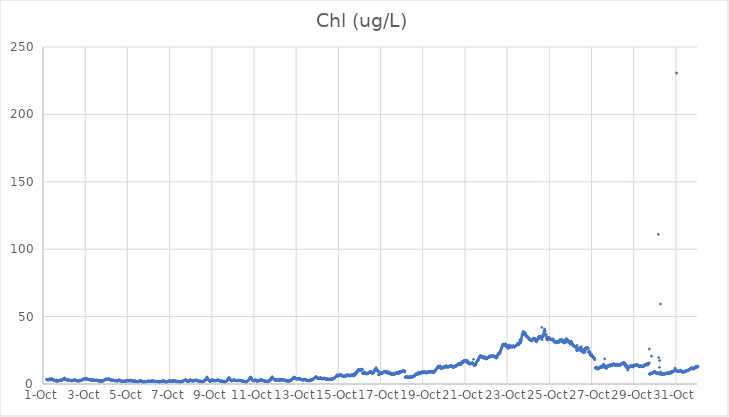
| Category | Chl (ug/L) |
|---|---|
| 44835.166666666664 | 3.35 |
| 44835.177083333336 | 3.45 |
| 44835.1875 | 3.31 |
| 44835.197916666664 | 3.45 |
| 44835.208333333336 | 3.27 |
| 44835.21875 | 3.15 |
| 44835.229166666664 | 3.12 |
| 44835.239583333336 | 2.91 |
| 44835.25 | 3.15 |
| 44835.260416666664 | 3.2 |
| 44835.270833333336 | 3.08 |
| 44835.28125 | 3.42 |
| 44835.291666666664 | 3.69 |
| 44835.302083333336 | 3.59 |
| 44835.3125 | 3.55 |
| 44835.322916666664 | 3.67 |
| 44835.333333333336 | 3.62 |
| 44835.34375 | 3.71 |
| 44835.354166666664 | 3.26 |
| 44835.364583333336 | 3.09 |
| 44835.375 | 3.1 |
| 44835.385416666664 | 3.78 |
| 44835.395833333336 | 3.61 |
| 44835.40625 | 3.42 |
| 44835.416666666664 | 3.48 |
| 44835.427083333336 | 3.47 |
| 44835.4375 | 3.51 |
| 44835.447916666664 | 3.62 |
| 44835.458333333336 | 3.54 |
| 44835.46875 | 3.47 |
| 44835.479166666664 | 3.13 |
| 44835.489583333336 | 2.75 |
| 44835.5 | 2.81 |
| 44835.510416666664 | 2.68 |
| 44835.520833333336 | 2.73 |
| 44835.53125 | 2.64 |
| 44835.541666666664 | 2.91 |
| 44835.552083333336 | 2.82 |
| 44835.5625 | 2.74 |
| 44835.572916666664 | 2.68 |
| 44835.583333333336 | 2.28 |
| 44835.59375 | 2.43 |
| 44835.604166666664 | 2.49 |
| 44835.614583333336 | 2.49 |
| 44835.625 | 2.88 |
| 44835.635416666664 | 2.78 |
| 44835.645833333336 | 1.88 |
| 44835.65625 | 2.36 |
| 44835.666666666664 | 2.53 |
| 44835.677083333336 | 2.5 |
| 44835.6875 | 2.61 |
| 44835.697916666664 | 2.34 |
| 44835.708333333336 | 2.54 |
| 44835.71875 | 2.65 |
| 44835.729166666664 | 2.31 |
| 44835.739583333336 | 2.56 |
| 44835.75 | 2.69 |
| 44835.760416666664 | 2.57 |
| 44835.770833333336 | 2.71 |
| 44835.78125 | 2.32 |
| 44835.791666666664 | 2.62 |
| 44835.802083333336 | 2.46 |
| 44835.8125 | 2.63 |
| 44835.822916666664 | 2.79 |
| 44835.833333333336 | 2.88 |
| 44835.84375 | 2.68 |
| 44835.854166666664 | 3.02 |
| 44835.864583333336 | 2.83 |
| 44835.875 | 2.84 |
| 44835.885416666664 | 2.99 |
| 44835.895833333336 | 2.89 |
| 44835.90625 | 3.06 |
| 44835.916666666664 | 2.99 |
| 44835.927083333336 | 3.11 |
| 44835.9375 | 3.11 |
| 44835.947916666664 | 3.25 |
| 44835.958333333336 | 3.62 |
| 44835.96875 | 3.66 |
| 44835.979166666664 | 3.68 |
| 44835.989583333336 | 3.55 |
| 44836.0 | 3.85 |
| 44836.010416666664 | 4.26 |
| 44836.020833333336 | 4.28 |
| 44836.03125 | 4.2 |
| 44836.041666666664 | 3.25 |
| 44836.052083333336 | 3.84 |
| 44836.0625 | 3.79 |
| 44836.072916666664 | 3.73 |
| 44836.083333333336 | 3.25 |
| 44836.09375 | 3.41 |
| 44836.104166666664 | 3.36 |
| 44836.114583333336 | 3.05 |
| 44836.125 | 3.14 |
| 44836.135416666664 | 2.97 |
| 44836.145833333336 | 3.1 |
| 44836.15625 | 2.86 |
| 44836.166666666664 | 2.95 |
| 44836.177083333336 | 2.73 |
| 44836.1875 | 2.84 |
| 44836.197916666664 | 3.12 |
| 44836.208333333336 | 2.78 |
| 44836.21875 | 2.68 |
| 44836.229166666664 | 3.06 |
| 44836.239583333336 | 2.82 |
| 44836.25 | 2.99 |
| 44836.260416666664 | 2.72 |
| 44836.270833333336 | 2.83 |
| 44836.28125 | 2.63 |
| 44836.291666666664 | 2.58 |
| 44836.302083333336 | 2.41 |
| 44836.3125 | 2.58 |
| 44836.322916666664 | 2.71 |
| 44836.333333333336 | 2.74 |
| 44836.34375 | 2.3 |
| 44836.354166666664 | 2.42 |
| 44836.364583333336 | 2.59 |
| 44836.375 | 2.53 |
| 44836.385416666664 | 2.45 |
| 44836.395833333336 | 2.54 |
| 44836.40625 | 2.65 |
| 44836.416666666664 | 2.81 |
| 44836.427083333336 | 2.66 |
| 44836.4375 | 2.69 |
| 44836.447916666664 | 2.8 |
| 44836.458333333336 | 2.63 |
| 44836.46875 | 2.55 |
| 44836.479166666664 | 2.53 |
| 44836.489583333336 | 2.65 |
| 44836.5 | 3.09 |
| 44836.510416666664 | 3.33 |
| 44836.520833333336 | 3.02 |
| 44836.53125 | 2.85 |
| 44836.541666666664 | 2.64 |
| 44836.552083333336 | 2.63 |
| 44836.5625 | 2.65 |
| 44836.572916666664 | 2.6 |
| 44836.583333333336 | 2.57 |
| 44836.59375 | 2.38 |
| 44836.604166666664 | 2.5 |
| 44836.614583333336 | 2.44 |
| 44836.625 | 2.42 |
| 44836.635416666664 | 2.44 |
| 44836.645833333336 | 2.43 |
| 44836.65625 | 2.37 |
| 44836.666666666664 | 2.46 |
| 44836.677083333336 | 2.27 |
| 44836.6875 | 2.31 |
| 44836.697916666664 | 2.32 |
| 44836.708333333336 | 2.3 |
| 44836.71875 | 2.44 |
| 44836.729166666664 | 2.39 |
| 44836.739583333336 | 2.5 |
| 44836.75 | 2.51 |
| 44836.760416666664 | 2.67 |
| 44836.770833333336 | 2.45 |
| 44836.78125 | 2.77 |
| 44836.791666666664 | 2.6 |
| 44836.802083333336 | 2.53 |
| 44836.8125 | 2.7 |
| 44836.822916666664 | 2.74 |
| 44836.833333333336 | 2.76 |
| 44836.84375 | 2.87 |
| 44836.854166666664 | 2.94 |
| 44836.864583333336 | 3.03 |
| 44836.875 | 3.3 |
| 44836.885416666664 | 3.43 |
| 44836.895833333336 | 3.3 |
| 44836.90625 | 3.44 |
| 44836.916666666664 | 3.63 |
| 44836.927083333336 | 3.62 |
| 44836.9375 | 3.6 |
| 44836.947916666664 | 3.82 |
| 44836.958333333336 | 3.97 |
| 44836.96875 | 3.95 |
| 44836.979166666664 | 4.02 |
| 44836.989583333336 | 3.85 |
| 44837.0 | 4.2 |
| 44837.010416666664 | 3.88 |
| 44837.020833333336 | 3.73 |
| 44837.03125 | 3.64 |
| 44837.041666666664 | 3.82 |
| 44837.052083333336 | 3.9 |
| 44837.0625 | 3.81 |
| 44837.072916666664 | 4.01 |
| 44837.083333333336 | 3.57 |
| 44837.09375 | 3.56 |
| 44837.104166666664 | 3.43 |
| 44837.114583333336 | 3.44 |
| 44837.125 | 3.5 |
| 44837.135416666664 | 3.31 |
| 44837.145833333336 | 3.26 |
| 44837.15625 | 3.37 |
| 44837.166666666664 | 3.44 |
| 44837.177083333336 | 3.42 |
| 44837.1875 | 3.43 |
| 44837.197916666664 | 3.43 |
| 44837.208333333336 | 3.1 |
| 44837.21875 | 3.19 |
| 44837.229166666664 | 3.17 |
| 44837.239583333336 | 2.99 |
| 44837.25 | 2.97 |
| 44837.260416666664 | 2.99 |
| 44837.270833333336 | 3.12 |
| 44837.28125 | 2.94 |
| 44837.291666666664 | 3.02 |
| 44837.302083333336 | 3.2 |
| 44837.3125 | 2.72 |
| 44837.322916666664 | 2.87 |
| 44837.333333333336 | 3.01 |
| 44837.34375 | 2.92 |
| 44837.354166666664 | 3.02 |
| 44837.364583333336 | 2.71 |
| 44837.375 | 2.73 |
| 44837.385416666664 | 2.78 |
| 44837.395833333336 | 2.93 |
| 44837.40625 | 2.77 |
| 44837.416666666664 | 2.51 |
| 44837.427083333336 | 2.92 |
| 44837.4375 | 2.92 |
| 44837.447916666664 | 2.69 |
| 44837.458333333336 | 2.89 |
| 44837.46875 | 2.68 |
| 44837.479166666664 | 2.6 |
| 44837.489583333336 | 2.64 |
| 44837.5 | 2.61 |
| 44837.510416666664 | 2.71 |
| 44837.520833333336 | 2.71 |
| 44837.53125 | 2.68 |
| 44837.541666666664 | 2.99 |
| 44837.552083333336 | 2.74 |
| 44837.5625 | 2.86 |
| 44837.572916666664 | 2.74 |
| 44837.583333333336 | 2.67 |
| 44837.59375 | 2.53 |
| 44837.604166666664 | 2.55 |
| 44837.614583333336 | 2.35 |
| 44837.625 | 2.31 |
| 44837.635416666664 | 2.34 |
| 44837.645833333336 | 2.25 |
| 44837.65625 | 2.31 |
| 44837.666666666664 | 2.21 |
| 44837.677083333336 | 2.17 |
| 44837.6875 | 2.27 |
| 44837.697916666664 | 2.23 |
| 44837.708333333336 | 2.26 |
| 44837.71875 | 2.26 |
| 44837.729166666664 | 2.09 |
| 44837.739583333336 | 2.36 |
| 44837.75 | 2.3 |
| 44837.760416666664 | 2.19 |
| 44837.770833333336 | 2.13 |
| 44837.78125 | 2.15 |
| 44837.791666666664 | 2.16 |
| 44837.802083333336 | 2.24 |
| 44837.8125 | 2.17 |
| 44837.822916666664 | 2.3 |
| 44837.833333333336 | 2.1 |
| 44837.84375 | 2.32 |
| 44837.854166666664 | 2.41 |
| 44837.864583333336 | 2.64 |
| 44837.875 | 2.68 |
| 44837.885416666664 | 2.8 |
| 44837.895833333336 | 2.8 |
| 44837.90625 | 2.83 |
| 44837.916666666664 | 3.19 |
| 44837.927083333336 | 3.1 |
| 44837.9375 | 3.3 |
| 44837.947916666664 | 3.26 |
| 44837.958333333336 | 3.4 |
| 44837.96875 | 3.43 |
| 44837.979166666664 | 3.57 |
| 44837.989583333336 | 3.4 |
| 44838.0 | 3.56 |
| 44838.010416666664 | 3.58 |
| 44838.020833333336 | 3.13 |
| 44838.03125 | 3.25 |
| 44838.041666666664 | 3.65 |
| 44838.052083333336 | 3.37 |
| 44838.0625 | 3.41 |
| 44838.072916666664 | 3.3 |
| 44838.083333333336 | 3.35 |
| 44838.09375 | 3.47 |
| 44838.104166666664 | 3.64 |
| 44838.114583333336 | 3.77 |
| 44838.125 | 3.61 |
| 44838.135416666664 | 3.61 |
| 44838.145833333336 | 3.4 |
| 44838.15625 | 3.44 |
| 44838.166666666664 | 3.46 |
| 44838.177083333336 | 3 |
| 44838.1875 | 3 |
| 44838.197916666664 | 3.1 |
| 44838.208333333336 | 2.96 |
| 44838.21875 | 2.98 |
| 44838.229166666664 | 2.97 |
| 44838.239583333336 | 2.94 |
| 44838.25 | 2.76 |
| 44838.260416666664 | 2.87 |
| 44838.270833333336 | 2.88 |
| 44838.28125 | 2.76 |
| 44838.291666666664 | 2.75 |
| 44838.302083333336 | 2.66 |
| 44838.3125 | 2.53 |
| 44838.322916666664 | 2.95 |
| 44838.333333333336 | 2.68 |
| 44838.34375 | 2.76 |
| 44838.354166666664 | 2.77 |
| 44838.364583333336 | 2.56 |
| 44838.375 | 2.69 |
| 44838.385416666664 | 2.7 |
| 44838.395833333336 | 2.39 |
| 44838.40625 | 2.49 |
| 44838.416666666664 | 2.55 |
| 44838.427083333336 | 2.53 |
| 44838.4375 | 2.57 |
| 44838.447916666664 | 2.63 |
| 44838.458333333336 | 2.49 |
| 44838.46875 | 2.32 |
| 44838.479166666664 | 2.32 |
| 44838.489583333336 | 2.54 |
| 44838.5 | 2.28 |
| 44838.510416666664 | 2.36 |
| 44838.520833333336 | 2.28 |
| 44838.53125 | 2.12 |
| 44838.541666666664 | 2.55 |
| 44838.552083333336 | 2.73 |
| 44838.5625 | 2.66 |
| 44838.572916666664 | 2.54 |
| 44838.583333333336 | 2.97 |
| 44838.59375 | 3.05 |
| 44838.604166666664 | 2.85 |
| 44838.614583333336 | 2.7 |
| 44838.625 | 2.7 |
| 44838.635416666664 | 2.33 |
| 44838.645833333336 | 2.32 |
| 44838.65625 | 2.42 |
| 44838.666666666664 | 2.21 |
| 44838.677083333336 | 2.49 |
| 44838.6875 | 2.33 |
| 44838.697916666664 | 2.19 |
| 44838.708333333336 | 2.34 |
| 44838.71875 | 2.35 |
| 44838.729166666664 | 2.13 |
| 44838.739583333336 | 2.03 |
| 44838.75 | 2.04 |
| 44838.760416666664 | 2.02 |
| 44838.770833333336 | 1.92 |
| 44838.78125 | 1.88 |
| 44838.791666666664 | 1.93 |
| 44838.802083333336 | 2.01 |
| 44838.8125 | 2.01 |
| 44838.822916666664 | 1.98 |
| 44838.833333333336 | 1.97 |
| 44838.84375 | 2.02 |
| 44838.854166666664 | 2.02 |
| 44838.864583333336 | 2.1 |
| 44838.875 | 1.99 |
| 44838.885416666664 | 2.14 |
| 44838.895833333336 | 2.24 |
| 44838.90625 | 2.22 |
| 44838.916666666664 | 2.11 |
| 44838.927083333336 | 2.19 |
| 44838.9375 | 2.13 |
| 44838.947916666664 | 2.25 |
| 44838.958333333336 | 2.36 |
| 44838.96875 | 2.43 |
| 44838.979166666664 | 2.34 |
| 44838.989583333336 | 2.84 |
| 44839.0 | 2.53 |
| 44839.010416666664 | 2.56 |
| 44839.020833333336 | 2.63 |
| 44839.03125 | 2.44 |
| 44839.041666666664 | 2.41 |
| 44839.052083333336 | 2.48 |
| 44839.0625 | 2.49 |
| 44839.072916666664 | 2.29 |
| 44839.083333333336 | 2.34 |
| 44839.09375 | 2.44 |
| 44839.104166666664 | 2.34 |
| 44839.114583333336 | 2.36 |
| 44839.125 | 2.38 |
| 44839.135416666664 | 2.34 |
| 44839.145833333336 | 2.52 |
| 44839.15625 | 2.84 |
| 44839.166666666664 | 2.92 |
| 44839.177083333336 | 2.81 |
| 44839.1875 | 2.63 |
| 44839.197916666664 | 2.35 |
| 44839.208333333336 | 2.42 |
| 44839.21875 | 2.37 |
| 44839.229166666664 | 2.23 |
| 44839.239583333336 | 2.2 |
| 44839.25 | 2.34 |
| 44839.260416666664 | 2.19 |
| 44839.270833333336 | 2.13 |
| 44839.28125 | 2.18 |
| 44839.291666666664 | 2.15 |
| 44839.302083333336 | 2.02 |
| 44839.3125 | 1.92 |
| 44839.322916666664 | 2.17 |
| 44839.333333333336 | 2.05 |
| 44839.34375 | 2.07 |
| 44839.354166666664 | 2.18 |
| 44839.364583333336 | 2.08 |
| 44839.375 | 2.11 |
| 44839.385416666664 | 2.03 |
| 44839.395833333336 | 1.71 |
| 44839.40625 | 1.94 |
| 44839.416666666664 | 1.72 |
| 44839.427083333336 | 1.98 |
| 44839.4375 | 1.83 |
| 44839.447916666664 | 1.92 |
| 44839.458333333336 | 1.83 |
| 44839.46875 | 1.78 |
| 44839.479166666664 | 1.69 |
| 44839.489583333336 | 1.66 |
| 44839.5 | 1.68 |
| 44839.510416666664 | 1.9 |
| 44839.520833333336 | 1.76 |
| 44839.53125 | 1.86 |
| 44839.541666666664 | 2.06 |
| 44839.552083333336 | 2.05 |
| 44839.5625 | 2.13 |
| 44839.572916666664 | 2.27 |
| 44839.583333333336 | 2.19 |
| 44839.59375 | 2.39 |
| 44839.604166666664 | 2.29 |
| 44839.614583333336 | 2.34 |
| 44839.625 | 2.42 |
| 44839.635416666664 | 2.34 |
| 44839.645833333336 | 2.32 |
| 44839.65625 | 2.37 |
| 44839.666666666664 | 2.22 |
| 44839.677083333336 | 2.18 |
| 44839.6875 | 1.97 |
| 44839.697916666664 | 1.97 |
| 44839.708333333336 | 1.68 |
| 44839.71875 | 1.63 |
| 44839.729166666664 | 1.51 |
| 44839.739583333336 | 1.62 |
| 44839.75 | 1.64 |
| 44839.760416666664 | 1.7 |
| 44839.770833333336 | 1.43 |
| 44839.78125 | 1.81 |
| 44839.791666666664 | 1.43 |
| 44839.802083333336 | 1.8 |
| 44839.8125 | 1.79 |
| 44839.822916666664 | 1.69 |
| 44839.833333333336 | 1.66 |
| 44839.84375 | 1.65 |
| 44839.854166666664 | 1.67 |
| 44839.864583333336 | 1.71 |
| 44839.875 | 1.75 |
| 44839.885416666664 | 1.8 |
| 44839.895833333336 | 1.72 |
| 44839.90625 | 1.76 |
| 44839.916666666664 | 1.89 |
| 44839.927083333336 | 1.87 |
| 44839.9375 | 2.04 |
| 44839.947916666664 | 2 |
| 44839.958333333336 | 1.92 |
| 44839.96875 | 1.9 |
| 44839.979166666664 | 2.05 |
| 44839.989583333336 | 2 |
| 44840.0 | 2.08 |
| 44840.010416666664 | 2.18 |
| 44840.020833333336 | 2.11 |
| 44840.03125 | 2.05 |
| 44840.041666666664 | 1.9 |
| 44840.052083333336 | 2.07 |
| 44840.0625 | 1.94 |
| 44840.072916666664 | 1.97 |
| 44840.083333333336 | 2.03 |
| 44840.09375 | 1.98 |
| 44840.104166666664 | 2 |
| 44840.114583333336 | 2.01 |
| 44840.125 | 1.9 |
| 44840.135416666664 | 2.15 |
| 44840.145833333336 | 2.06 |
| 44840.15625 | 2.21 |
| 44840.166666666664 | 2.09 |
| 44840.177083333336 | 2.14 |
| 44840.1875 | 2.34 |
| 44840.197916666664 | 2.32 |
| 44840.208333333336 | 2.41 |
| 44840.21875 | 2.15 |
| 44840.229166666664 | 2.38 |
| 44840.239583333336 | 2.18 |
| 44840.25 | 2.21 |
| 44840.260416666664 | 2.06 |
| 44840.270833333336 | 1.96 |
| 44840.28125 | 2 |
| 44840.291666666664 | 1.78 |
| 44840.302083333336 | 1.87 |
| 44840.3125 | 1.82 |
| 44840.322916666664 | 1.79 |
| 44840.333333333336 | 1.91 |
| 44840.34375 | 1.82 |
| 44840.354166666664 | 1.99 |
| 44840.364583333336 | 1.74 |
| 44840.375 | 1.72 |
| 44840.385416666664 | 1.9 |
| 44840.395833333336 | 1.92 |
| 44840.40625 | 1.83 |
| 44840.416666666664 | 1.81 |
| 44840.427083333336 | 1.9 |
| 44840.4375 | 1.82 |
| 44840.447916666664 | 1.97 |
| 44840.458333333336 | 1.83 |
| 44840.46875 | 1.58 |
| 44840.479166666664 | 1.46 |
| 44840.489583333336 | 1.44 |
| 44840.5 | 1.56 |
| 44840.510416666664 | 1.57 |
| 44840.520833333336 | 1.82 |
| 44840.53125 | 1.73 |
| 44840.541666666664 | 1.6 |
| 44840.552083333336 | 1.89 |
| 44840.5625 | 1.86 |
| 44840.572916666664 | 1.71 |
| 44840.583333333336 | 1.84 |
| 44840.59375 | 1.91 |
| 44840.604166666664 | 2.05 |
| 44840.614583333336 | 1.92 |
| 44840.625 | 1.83 |
| 44840.635416666664 | 1.97 |
| 44840.645833333336 | 1.97 |
| 44840.65625 | 2.09 |
| 44840.666666666664 | 1.96 |
| 44840.677083333336 | 2.01 |
| 44840.6875 | 1.9 |
| 44840.697916666664 | 2.36 |
| 44840.708333333336 | 2.32 |
| 44840.71875 | 2.37 |
| 44840.729166666664 | 2.23 |
| 44840.739583333336 | 2.09 |
| 44840.75 | 2.07 |
| 44840.760416666664 | 1.86 |
| 44840.770833333336 | 1.57 |
| 44840.78125 | 1.52 |
| 44840.791666666664 | 1.74 |
| 44840.802083333336 | 1.59 |
| 44840.8125 | 1.55 |
| 44840.822916666664 | 1.46 |
| 44840.833333333336 | 1.61 |
| 44840.84375 | 1.64 |
| 44840.854166666664 | 1.61 |
| 44840.864583333336 | 1.64 |
| 44840.875 | 1.67 |
| 44840.885416666664 | 1.67 |
| 44840.895833333336 | 1.83 |
| 44840.90625 | 1.72 |
| 44840.916666666664 | 1.8 |
| 44840.927083333336 | 1.9 |
| 44840.9375 | 1.97 |
| 44840.947916666664 | 1.95 |
| 44840.958333333336 | 2.43 |
| 44840.96875 | 1.97 |
| 44840.979166666664 | 2.44 |
| 44840.989583333336 | 1.89 |
| 44841.0 | 2.16 |
| 44841.010416666664 | 2.01 |
| 44841.020833333336 | 2.06 |
| 44841.03125 | 2.21 |
| 44841.041666666664 | 2.02 |
| 44841.052083333336 | 2.26 |
| 44841.0625 | 2.16 |
| 44841.072916666664 | 2.09 |
| 44841.083333333336 | 2.08 |
| 44841.09375 | 2.03 |
| 44841.104166666664 | 1.95 |
| 44841.114583333336 | 2.01 |
| 44841.125 | 2.11 |
| 44841.135416666664 | 2.12 |
| 44841.145833333336 | 2.28 |
| 44841.15625 | 2.32 |
| 44841.166666666664 | 2.25 |
| 44841.177083333336 | 2.43 |
| 44841.1875 | 2.19 |
| 44841.197916666664 | 2.19 |
| 44841.208333333336 | 2.17 |
| 44841.21875 | 2.36 |
| 44841.229166666664 | 2.45 |
| 44841.239583333336 | 2.28 |
| 44841.25 | 2.18 |
| 44841.260416666664 | 2.33 |
| 44841.270833333336 | 2.35 |
| 44841.28125 | 2.11 |
| 44841.291666666664 | 2.03 |
| 44841.302083333336 | 2.04 |
| 44841.3125 | 2.1 |
| 44841.322916666664 | 1.96 |
| 44841.333333333336 | 1.84 |
| 44841.34375 | 1.78 |
| 44841.354166666664 | 1.85 |
| 44841.364583333336 | 1.79 |
| 44841.375 | 1.89 |
| 44841.385416666664 | 1.82 |
| 44841.395833333336 | 1.76 |
| 44841.40625 | 1.81 |
| 44841.416666666664 | 1.87 |
| 44841.427083333336 | 1.83 |
| 44841.4375 | 1.97 |
| 44841.447916666664 | 1.97 |
| 44841.458333333336 | 1.76 |
| 44841.46875 | 1.66 |
| 44841.479166666664 | 1.53 |
| 44841.489583333336 | 1.52 |
| 44841.5 | 1.65 |
| 44841.510416666664 | 1.57 |
| 44841.520833333336 | 1.53 |
| 44841.53125 | 1.55 |
| 44841.541666666664 | 1.67 |
| 44841.552083333336 | 1.71 |
| 44841.5625 | 1.69 |
| 44841.572916666664 | 1.59 |
| 44841.583333333336 | 1.7 |
| 44841.59375 | 1.96 |
| 44841.604166666664 | 2.1 |
| 44841.614583333336 | 2.15 |
| 44841.625 | 2.11 |
| 44841.635416666664 | 2.25 |
| 44841.645833333336 | 2.2 |
| 44841.65625 | 2.08 |
| 44841.666666666664 | 2.32 |
| 44841.677083333336 | 2.48 |
| 44841.6875 | 2.49 |
| 44841.697916666664 | 2.64 |
| 44841.708333333336 | 2.64 |
| 44841.71875 | 2.98 |
| 44841.729166666664 | 3 |
| 44841.739583333336 | 2.76 |
| 44841.75 | 2.99 |
| 44841.760416666664 | 3.24 |
| 44841.770833333336 | 2.76 |
| 44841.78125 | 2.64 |
| 44841.791666666664 | 2.59 |
| 44841.802083333336 | 2.5 |
| 44841.8125 | 2.35 |
| 44841.822916666664 | 2.17 |
| 44841.833333333336 | 2.25 |
| 44841.84375 | 1.98 |
| 44841.854166666664 | 2.14 |
| 44841.864583333336 | 2.08 |
| 44841.875 | 2.16 |
| 44841.885416666664 | 2.11 |
| 44841.895833333336 | 2.03 |
| 44841.90625 | 2.15 |
| 44841.916666666664 | 1.95 |
| 44841.927083333336 | 2.12 |
| 44841.9375 | 2.22 |
| 44841.947916666664 | 2.27 |
| 44841.958333333336 | 2.72 |
| 44841.96875 | 2.75 |
| 44841.979166666664 | 2.85 |
| 44841.989583333336 | 3.36 |
| 44842.0 | 2.88 |
| 44842.010416666664 | 2.46 |
| 44842.020833333336 | 2.53 |
| 44842.03125 | 2.44 |
| 44842.041666666664 | 2.37 |
| 44842.052083333336 | 2.52 |
| 44842.0625 | 2.54 |
| 44842.072916666664 | 2.32 |
| 44842.083333333336 | 2.73 |
| 44842.09375 | 2.32 |
| 44842.104166666664 | 2.22 |
| 44842.114583333336 | 2.27 |
| 44842.125 | 2.34 |
| 44842.135416666664 | 2.41 |
| 44842.145833333336 | 2.32 |
| 44842.15625 | 2.35 |
| 44842.166666666664 | 2.62 |
| 44842.177083333336 | 2.49 |
| 44842.1875 | 2.65 |
| 44842.197916666664 | 2.72 |
| 44842.208333333336 | 2.64 |
| 44842.21875 | 2.68 |
| 44842.229166666664 | 2.66 |
| 44842.239583333336 | 2.6 |
| 44842.25 | 2.65 |
| 44842.260416666664 | 3.04 |
| 44842.270833333336 | 2.88 |
| 44842.28125 | 2.5 |
| 44842.291666666664 | 2.66 |
| 44842.302083333336 | 2.77 |
| 44842.3125 | 2.53 |
| 44842.322916666664 | 2.51 |
| 44842.333333333336 | 2.3 |
| 44842.34375 | 2.23 |
| 44842.354166666664 | 2.23 |
| 44842.364583333336 | 2.19 |
| 44842.375 | 2.13 |
| 44842.385416666664 | 2.13 |
| 44842.395833333336 | 2.05 |
| 44842.40625 | 2.07 |
| 44842.416666666664 | 2 |
| 44842.427083333336 | 2.09 |
| 44842.4375 | 2.13 |
| 44842.447916666664 | 2.09 |
| 44842.458333333336 | 2.19 |
| 44842.46875 | 1.88 |
| 44842.479166666664 | 1.82 |
| 44842.489583333336 | 1.87 |
| 44842.5 | 1.82 |
| 44842.510416666664 | 1.7 |
| 44842.520833333336 | 1.75 |
| 44842.53125 | 1.61 |
| 44842.541666666664 | 1.75 |
| 44842.552083333336 | 1.65 |
| 44842.5625 | 1.61 |
| 44842.572916666664 | 1.83 |
| 44842.583333333336 | 1.94 |
| 44842.59375 | 2.05 |
| 44842.604166666664 | 2.12 |
| 44842.614583333336 | 2.24 |
| 44842.625 | 2.24 |
| 44842.635416666664 | 2.55 |
| 44842.645833333336 | 2.25 |
| 44842.65625 | 2.33 |
| 44842.666666666664 | 2.5 |
| 44842.677083333336 | 2.62 |
| 44842.6875 | 2.62 |
| 44842.697916666664 | 3.03 |
| 44842.708333333336 | 3.18 |
| 44842.71875 | 3.04 |
| 44842.729166666664 | 4.02 |
| 44842.739583333336 | 4.1 |
| 44842.75 | 3.89 |
| 44842.760416666664 | 4.59 |
| 44842.770833333336 | 5.18 |
| 44842.78125 | 4.37 |
| 44842.791666666664 | 3.88 |
| 44842.802083333336 | 4 |
| 44842.8125 | 4.12 |
| 44842.822916666664 | 3.7 |
| 44842.833333333336 | 3.26 |
| 44842.84375 | 2.95 |
| 44842.854166666664 | 2.7 |
| 44842.864583333336 | 2.56 |
| 44842.875 | 2.44 |
| 44842.885416666664 | 2.26 |
| 44842.895833333336 | 2.14 |
| 44842.90625 | 2.1 |
| 44842.916666666664 | 2.1 |
| 44842.927083333336 | 2.11 |
| 44842.9375 | 2.26 |
| 44842.947916666664 | 2.47 |
| 44842.958333333336 | 2.68 |
| 44842.96875 | 2.57 |
| 44842.979166666664 | 2.62 |
| 44842.989583333336 | 3.02 |
| 44843.0 | 3.04 |
| 44843.010416666664 | 3.01 |
| 44843.020833333336 | 2.98 |
| 44843.03125 | 3.29 |
| 44843.041666666664 | 3.1 |
| 44843.052083333336 | 2.53 |
| 44843.0625 | 2.35 |
| 44843.072916666664 | 2.45 |
| 44843.083333333336 | 2.47 |
| 44843.09375 | 2.8 |
| 44843.104166666664 | 2.62 |
| 44843.114583333336 | 2.57 |
| 44843.125 | 2.5 |
| 44843.135416666664 | 2.43 |
| 44843.145833333336 | 2.41 |
| 44843.15625 | 2.48 |
| 44843.166666666664 | 2.4 |
| 44843.177083333336 | 2.48 |
| 44843.1875 | 2.47 |
| 44843.197916666664 | 2.63 |
| 44843.208333333336 | 2.73 |
| 44843.21875 | 2.57 |
| 44843.229166666664 | 2.67 |
| 44843.239583333336 | 2.57 |
| 44843.25 | 2.7 |
| 44843.260416666664 | 2.77 |
| 44843.270833333336 | 2.59 |
| 44843.28125 | 2.81 |
| 44843.291666666664 | 3.22 |
| 44843.302083333336 | 2.64 |
| 44843.3125 | 2.79 |
| 44843.322916666664 | 2.86 |
| 44843.333333333336 | 2.73 |
| 44843.34375 | 2.49 |
| 44843.354166666664 | 2.33 |
| 44843.364583333336 | 2.61 |
| 44843.375 | 2.47 |
| 44843.385416666664 | 2.31 |
| 44843.395833333336 | 2.15 |
| 44843.40625 | 2.17 |
| 44843.416666666664 | 2.17 |
| 44843.427083333336 | 2.2 |
| 44843.4375 | 2.29 |
| 44843.447916666664 | 2.16 |
| 44843.458333333336 | 2.12 |
| 44843.46875 | 2.05 |
| 44843.479166666664 | 1.92 |
| 44843.489583333336 | 1.97 |
| 44843.5 | 1.96 |
| 44843.510416666664 | 2.08 |
| 44843.520833333336 | 1.84 |
| 44843.53125 | 2.01 |
| 44843.541666666664 | 1.93 |
| 44843.552083333336 | 2.02 |
| 44843.5625 | 1.68 |
| 44843.572916666664 | 1.61 |
| 44843.583333333336 | 1.66 |
| 44843.59375 | 1.56 |
| 44843.604166666664 | 1.63 |
| 44843.614583333336 | 1.73 |
| 44843.625 | 1.63 |
| 44843.635416666664 | 1.86 |
| 44843.645833333336 | 1.88 |
| 44843.65625 | 1.76 |
| 44843.666666666664 | 1.84 |
| 44843.677083333336 | 2.05 |
| 44843.6875 | 2.22 |
| 44843.697916666664 | 2.02 |
| 44843.708333333336 | 2.42 |
| 44843.71875 | 2.46 |
| 44843.729166666664 | 2.55 |
| 44843.739583333336 | 2.91 |
| 44843.75 | 3.07 |
| 44843.760416666664 | 3.72 |
| 44843.770833333336 | 3.19 |
| 44843.78125 | 4.32 |
| 44843.791666666664 | 4.21 |
| 44843.802083333336 | 4.4 |
| 44843.8125 | 4.59 |
| 44843.822916666664 | 3.84 |
| 44843.833333333336 | 4.42 |
| 44843.84375 | 4.09 |
| 44843.854166666664 | 4 |
| 44843.864583333336 | 3.74 |
| 44843.875 | 3.31 |
| 44843.885416666664 | 3.23 |
| 44843.895833333336 | 2.76 |
| 44843.90625 | 2.75 |
| 44843.916666666664 | 2.59 |
| 44843.927083333336 | 2.43 |
| 44843.9375 | 2.44 |
| 44843.947916666664 | 2.42 |
| 44843.958333333336 | 2.47 |
| 44843.96875 | 2.64 |
| 44843.979166666664 | 2.45 |
| 44843.989583333336 | 2.64 |
| 44844.0 | 2.51 |
| 44844.010416666664 | 3.04 |
| 44844.020833333336 | 2.77 |
| 44844.03125 | 2.81 |
| 44844.041666666664 | 3.04 |
| 44844.052083333336 | 3.11 |
| 44844.0625 | 3.2 |
| 44844.072916666664 | 2.73 |
| 44844.083333333336 | 2.54 |
| 44844.09375 | 2.7 |
| 44844.104166666664 | 2.75 |
| 44844.114583333336 | 2.57 |
| 44844.125 | 2.59 |
| 44844.135416666664 | 2.62 |
| 44844.145833333336 | 2.47 |
| 44844.15625 | 2.63 |
| 44844.166666666664 | 2.55 |
| 44844.177083333336 | 2.53 |
| 44844.1875 | 2.6 |
| 44844.197916666664 | 2.46 |
| 44844.208333333336 | 2.52 |
| 44844.21875 | 2.56 |
| 44844.229166666664 | 2.51 |
| 44844.239583333336 | 2.61 |
| 44844.25 | 2.57 |
| 44844.260416666664 | 2.44 |
| 44844.270833333336 | 2.71 |
| 44844.28125 | 2.75 |
| 44844.291666666664 | 2.61 |
| 44844.302083333336 | 2.72 |
| 44844.3125 | 2.72 |
| 44844.322916666664 | 2.65 |
| 44844.333333333336 | 2.54 |
| 44844.34375 | 2.61 |
| 44844.354166666664 | 2.78 |
| 44844.364583333336 | 2.58 |
| 44844.375 | 2.59 |
| 44844.385416666664 | 2.5 |
| 44844.395833333336 | 2.22 |
| 44844.40625 | 2.15 |
| 44844.416666666664 | 2.07 |
| 44844.427083333336 | 2.27 |
| 44844.4375 | 2.16 |
| 44844.447916666664 | 2.31 |
| 44844.458333333336 | 2.31 |
| 44844.46875 | 2.1 |
| 44844.479166666664 | 1.98 |
| 44844.489583333336 | 2.02 |
| 44844.5 | 1.99 |
| 44844.510416666664 | 2.05 |
| 44844.520833333336 | 1.91 |
| 44844.53125 | 1.81 |
| 44844.541666666664 | 1.72 |
| 44844.552083333336 | 1.76 |
| 44844.5625 | 1.74 |
| 44844.572916666664 | 1.64 |
| 44844.583333333336 | 1.7 |
| 44844.59375 | 1.69 |
| 44844.604166666664 | 1.62 |
| 44844.614583333336 | 1.68 |
| 44844.625 | 1.51 |
| 44844.635416666664 | 1.56 |
| 44844.645833333336 | 1.45 |
| 44844.65625 | 1.67 |
| 44844.666666666664 | 2.07 |
| 44844.677083333336 | 2 |
| 44844.6875 | 2.1 |
| 44844.697916666664 | 2.17 |
| 44844.708333333336 | 2.4 |
| 44844.71875 | 2.4 |
| 44844.729166666664 | 2.7 |
| 44844.739583333336 | 2.98 |
| 44844.75 | 3.19 |
| 44844.760416666664 | 2.97 |
| 44844.770833333336 | 3.26 |
| 44844.78125 | 3.64 |
| 44844.791666666664 | 3.66 |
| 44844.802083333336 | 4.44 |
| 44844.8125 | 4.5 |
| 44844.822916666664 | 4.89 |
| 44844.833333333336 | 4.96 |
| 44844.84375 | 5.08 |
| 44844.854166666664 | 4.08 |
| 44844.864583333336 | 4.81 |
| 44844.875 | 4.51 |
| 44844.885416666664 | 4.13 |
| 44844.895833333336 | 3.44 |
| 44844.90625 | 3.31 |
| 44844.916666666664 | 3.02 |
| 44844.927083333336 | 2.73 |
| 44844.9375 | 2.73 |
| 44844.947916666664 | 2.78 |
| 44844.958333333336 | 2.62 |
| 44844.96875 | 2.73 |
| 44844.979166666664 | 2.48 |
| 44844.989583333336 | 2.54 |
| 44845.0 | 2.34 |
| 44845.010416666664 | 2.42 |
| 44845.020833333336 | 2.44 |
| 44845.03125 | 2.79 |
| 44845.041666666664 | 2.76 |
| 44845.052083333336 | 2.84 |
| 44845.0625 | 3 |
| 44845.072916666664 | 2.74 |
| 44845.083333333336 | 2.73 |
| 44845.09375 | 3.09 |
| 44845.104166666664 | 2.14 |
| 44845.114583333336 | 2.5 |
| 44845.125 | 2.48 |
| 44845.135416666664 | 2.53 |
| 44845.145833333336 | 2.39 |
| 44845.15625 | 2.12 |
| 44845.166666666664 | 2.21 |
| 44845.177083333336 | 2.19 |
| 44845.1875 | 2.3 |
| 44845.197916666664 | 2.37 |
| 44845.208333333336 | 2.41 |
| 44845.21875 | 2.3 |
| 44845.229166666664 | 2.52 |
| 44845.239583333336 | 2.76 |
| 44845.25 | 2.83 |
| 44845.260416666664 | 2.58 |
| 44845.270833333336 | 2.7 |
| 44845.28125 | 2.88 |
| 44845.291666666664 | 2.82 |
| 44845.302083333336 | 2.84 |
| 44845.3125 | 2.94 |
| 44845.322916666664 | 3.17 |
| 44845.333333333336 | 3.19 |
| 44845.34375 | 3.07 |
| 44845.354166666664 | 2.95 |
| 44845.364583333336 | 2.95 |
| 44845.375 | 2.7 |
| 44845.385416666664 | 2.89 |
| 44845.395833333336 | 2.72 |
| 44845.40625 | 2.68 |
| 44845.416666666664 | 2.79 |
| 44845.427083333336 | 2.59 |
| 44845.4375 | 2.62 |
| 44845.447916666664 | 2.44 |
| 44845.458333333336 | 2.4 |
| 44845.46875 | 2.53 |
| 44845.479166666664 | 2.35 |
| 44845.489583333336 | 2.26 |
| 44845.5 | 2.38 |
| 44845.510416666664 | 2.17 |
| 44845.520833333336 | 2.22 |
| 44845.53125 | 2.05 |
| 44845.541666666664 | 2.01 |
| 44845.552083333336 | 1.88 |
| 44845.5625 | 1.9 |
| 44845.572916666664 | 1.81 |
| 44845.583333333336 | 2.11 |
| 44845.59375 | 2.09 |
| 44845.604166666664 | 1.97 |
| 44845.614583333336 | 2.14 |
| 44845.625 | 1.97 |
| 44845.635416666664 | 1.8 |
| 44845.645833333336 | 1.76 |
| 44845.65625 | 1.81 |
| 44845.666666666664 | 1.84 |
| 44845.677083333336 | 1.88 |
| 44845.6875 | 1.93 |
| 44845.697916666664 | 2.1 |
| 44845.708333333336 | 2.13 |
| 44845.71875 | 2.31 |
| 44845.729166666664 | 2.71 |
| 44845.739583333336 | 2.59 |
| 44845.75 | 3.01 |
| 44845.760416666664 | 3.05 |
| 44845.770833333336 | 3.16 |
| 44845.78125 | 2.88 |
| 44845.791666666664 | 3.59 |
| 44845.802083333336 | 3.44 |
| 44845.8125 | 3.69 |
| 44845.822916666664 | 4.32 |
| 44845.833333333336 | 4.65 |
| 44845.84375 | 4.84 |
| 44845.854166666664 | 4.58 |
| 44845.864583333336 | 5.37 |
| 44845.875 | 4.47 |
| 44845.885416666664 | 4.46 |
| 44845.895833333336 | 4.5 |
| 44845.90625 | 3.88 |
| 44845.916666666664 | 3.58 |
| 44845.927083333336 | 3.51 |
| 44845.9375 | 3.48 |
| 44845.947916666664 | 3.65 |
| 44845.958333333336 | 3.67 |
| 44845.96875 | 3.26 |
| 44845.979166666664 | 3.17 |
| 44845.989583333336 | 2.98 |
| 44846.0 | 3.02 |
| 44846.010416666664 | 2.92 |
| 44846.020833333336 | 2.75 |
| 44846.03125 | 2.91 |
| 44846.041666666664 | 2.77 |
| 44846.052083333336 | 3.06 |
| 44846.0625 | 2.99 |
| 44846.072916666664 | 3.05 |
| 44846.083333333336 | 3.15 |
| 44846.09375 | 3.29 |
| 44846.104166666664 | 3.18 |
| 44846.114583333336 | 3.01 |
| 44846.125 | 3.21 |
| 44846.135416666664 | 3.15 |
| 44846.145833333336 | 2.87 |
| 44846.15625 | 2.78 |
| 44846.166666666664 | 2.64 |
| 44846.177083333336 | 2.56 |
| 44846.1875 | 2.89 |
| 44846.197916666664 | 2.78 |
| 44846.208333333336 | 2.7 |
| 44846.21875 | 3.4 |
| 44846.229166666664 | 3.02 |
| 44846.239583333336 | 3.51 |
| 44846.25 | 3.43 |
| 44846.260416666664 | 2.79 |
| 44846.270833333336 | 3 |
| 44846.28125 | 2.95 |
| 44846.291666666664 | 2.85 |
| 44846.302083333336 | 2.8 |
| 44846.3125 | 2.91 |
| 44846.322916666664 | 3.16 |
| 44846.333333333336 | 2.93 |
| 44846.34375 | 3.2 |
| 44846.354166666664 | 3.28 |
| 44846.364583333336 | 3.34 |
| 44846.375 | 3.04 |
| 44846.385416666664 | 3.12 |
| 44846.395833333336 | 2.93 |
| 44846.40625 | 2.76 |
| 44846.416666666664 | 3.06 |
| 44846.427083333336 | 2.98 |
| 44846.4375 | 2.77 |
| 44846.447916666664 | 2.69 |
| 44846.458333333336 | 2.66 |
| 44846.46875 | 2.59 |
| 44846.479166666664 | 2.45 |
| 44846.489583333336 | 2.44 |
| 44846.5 | 2.53 |
| 44846.510416666664 | 2.97 |
| 44846.520833333336 | 2.49 |
| 44846.53125 | 2.38 |
| 44846.541666666664 | 2.57 |
| 44846.552083333336 | 2.35 |
| 44846.5625 | 2.41 |
| 44846.572916666664 | 2.12 |
| 44846.583333333336 | 2.21 |
| 44846.59375 | 2.18 |
| 44846.604166666664 | 2.15 |
| 44846.614583333336 | 2.05 |
| 44846.625 | 2.5 |
| 44846.635416666664 | 2.13 |
| 44846.645833333336 | 2.4 |
| 44846.65625 | 2.28 |
| 44846.666666666664 | 2.13 |
| 44846.677083333336 | 2.08 |
| 44846.6875 | 2.06 |
| 44846.697916666664 | 2.2 |
| 44846.708333333336 | 2.36 |
| 44846.71875 | 2.47 |
| 44846.729166666664 | 2.64 |
| 44846.739583333336 | 2.57 |
| 44846.75 | 2.68 |
| 44846.760416666664 | 2.99 |
| 44846.770833333336 | 2.95 |
| 44846.78125 | 3.27 |
| 44846.791666666664 | 3.41 |
| 44846.802083333336 | 3.27 |
| 44846.8125 | 3.31 |
| 44846.822916666664 | 3.75 |
| 44846.833333333336 | 3.99 |
| 44846.84375 | 4.3 |
| 44846.854166666664 | 4.29 |
| 44846.864583333336 | 4.51 |
| 44846.875 | 4.54 |
| 44846.885416666664 | 4.97 |
| 44846.895833333336 | 5.11 |
| 44846.90625 | 4.44 |
| 44846.916666666664 | 4.6 |
| 44846.927083333336 | 4.67 |
| 44846.9375 | 4.03 |
| 44846.947916666664 | 4.77 |
| 44846.958333333336 | 4.51 |
| 44846.96875 | 4.35 |
| 44846.979166666664 | 4.27 |
| 44846.989583333336 | 3.96 |
| 44847.0 | 3.76 |
| 44847.010416666664 | 3.72 |
| 44847.020833333336 | 3.84 |
| 44847.03125 | 3.97 |
| 44847.041666666664 | 3.57 |
| 44847.052083333336 | 3.94 |
| 44847.0625 | 3.86 |
| 44847.072916666664 | 3.87 |
| 44847.083333333336 | 3.8 |
| 44847.09375 | 4.11 |
| 44847.104166666664 | 4.07 |
| 44847.114583333336 | 3.89 |
| 44847.125 | 4.01 |
| 44847.135416666664 | 3.9 |
| 44847.145833333336 | 4.11 |
| 44847.15625 | 4.02 |
| 44847.166666666664 | 3.62 |
| 44847.177083333336 | 3.92 |
| 44847.1875 | 3.56 |
| 44847.197916666664 | 3.49 |
| 44847.208333333336 | 3.7 |
| 44847.21875 | 3.47 |
| 44847.229166666664 | 3.68 |
| 44847.239583333336 | 3.4 |
| 44847.25 | 3.27 |
| 44847.260416666664 | 3.16 |
| 44847.270833333336 | 3.08 |
| 44847.28125 | 3.12 |
| 44847.291666666664 | 3.08 |
| 44847.302083333336 | 3.15 |
| 44847.3125 | 3.05 |
| 44847.322916666664 | 3.08 |
| 44847.333333333336 | 3.06 |
| 44847.34375 | 3.03 |
| 44847.354166666664 | 3.05 |
| 44847.364583333336 | 3.24 |
| 44847.375 | 3.56 |
| 44847.385416666664 | 3.36 |
| 44847.395833333336 | 3.47 |
| 44847.40625 | 3.38 |
| 44847.416666666664 | 3.05 |
| 44847.427083333336 | 3.2 |
| 44847.4375 | 2.93 |
| 44847.447916666664 | 2.95 |
| 44847.458333333336 | 3.09 |
| 44847.46875 | 3.03 |
| 44847.479166666664 | 2.86 |
| 44847.489583333336 | 2.79 |
| 44847.5 | 2.71 |
| 44847.510416666664 | 2.65 |
| 44847.520833333336 | 2.56 |
| 44847.53125 | 2.49 |
| 44847.541666666664 | 2.54 |
| 44847.552083333336 | 2.59 |
| 44847.5625 | 2.59 |
| 44847.572916666664 | 2.56 |
| 44847.583333333336 | 2.42 |
| 44847.59375 | 2.45 |
| 44847.604166666664 | 2.53 |
| 44847.614583333336 | 2.43 |
| 44847.625 | 2.72 |
| 44847.635416666664 | 2.4 |
| 44847.645833333336 | 2.44 |
| 44847.65625 | 2.49 |
| 44847.666666666664 | 2.58 |
| 44847.677083333336 | 2.87 |
| 44847.6875 | 2.99 |
| 44847.697916666664 | 3.33 |
| 44847.708333333336 | 2.71 |
| 44847.71875 | 3.13 |
| 44847.729166666664 | 2.96 |
| 44847.739583333336 | 2.89 |
| 44847.75 | 2.94 |
| 44847.760416666664 | 3.11 |
| 44847.770833333336 | 3.47 |
| 44847.78125 | 3.33 |
| 44847.791666666664 | 3.49 |
| 44847.802083333336 | 3.69 |
| 44847.8125 | 3.68 |
| 44847.822916666664 | 3.67 |
| 44847.833333333336 | 3.78 |
| 44847.84375 | 3.93 |
| 44847.854166666664 | 4.31 |
| 44847.864583333336 | 4.46 |
| 44847.875 | 4.61 |
| 44847.885416666664 | 4.62 |
| 44847.895833333336 | 4.84 |
| 44847.90625 | 4.75 |
| 44847.916666666664 | 4.79 |
| 44847.927083333336 | 5.27 |
| 44847.9375 | 5.09 |
| 44847.947916666664 | 5.02 |
| 44847.958333333336 | 5.45 |
| 44847.96875 | 4.79 |
| 44847.979166666664 | 5.12 |
| 44847.989583333336 | 4.49 |
| 44848.0 | 4.3 |
| 44848.010416666664 | 4.26 |
| 44848.020833333336 | 4.25 |
| 44848.03125 | 4.57 |
| 44848.041666666664 | 4.2 |
| 44848.052083333336 | 4.09 |
| 44848.0625 | 4.31 |
| 44848.072916666664 | 3.99 |
| 44848.083333333336 | 4.15 |
| 44848.09375 | 4.14 |
| 44848.104166666664 | 4.21 |
| 44848.114583333336 | 4 |
| 44848.125 | 4.4 |
| 44848.135416666664 | 4.23 |
| 44848.145833333336 | 4.72 |
| 44848.15625 | 4.61 |
| 44848.166666666664 | 4.7 |
| 44848.177083333336 | 4.38 |
| 44848.1875 | 4 |
| 44848.197916666664 | 4.13 |
| 44848.208333333336 | 4.09 |
| 44848.21875 | 3.89 |
| 44848.229166666664 | 3.91 |
| 44848.239583333336 | 3.8 |
| 44848.25 | 3.79 |
| 44848.260416666664 | 4.16 |
| 44848.270833333336 | 3.88 |
| 44848.28125 | 3.93 |
| 44848.291666666664 | 4.09 |
| 44848.302083333336 | 3.97 |
| 44848.3125 | 4.27 |
| 44848.322916666664 | 4.04 |
| 44848.333333333336 | 4.27 |
| 44848.34375 | 4.34 |
| 44848.354166666664 | 4.06 |
| 44848.364583333336 | 4.07 |
| 44848.375 | 3.99 |
| 44848.385416666664 | 3.59 |
| 44848.395833333336 | 3.48 |
| 44848.40625 | 3.88 |
| 44848.416666666664 | 4.04 |
| 44848.427083333336 | 3.99 |
| 44848.4375 | 3.76 |
| 44848.447916666664 | 3.56 |
| 44848.458333333336 | 3.78 |
| 44848.46875 | 3.61 |
| 44848.479166666664 | 3.58 |
| 44848.489583333336 | 3.5 |
| 44848.5 | 3.45 |
| 44848.510416666664 | 3.43 |
| 44848.520833333336 | 3.4 |
| 44848.53125 | 3.39 |
| 44848.541666666664 | 3.53 |
| 44848.552083333336 | 3.72 |
| 44848.5625 | 3.45 |
| 44848.572916666664 | 3.65 |
| 44848.583333333336 | 3.55 |
| 44848.59375 | 3.39 |
| 44848.604166666664 | 3.45 |
| 44848.614583333336 | 3.28 |
| 44848.625 | 3.48 |
| 44848.635416666664 | 3.35 |
| 44848.645833333336 | 3.7 |
| 44848.65625 | 3.21 |
| 44848.666666666664 | 3.26 |
| 44848.677083333336 | 3.48 |
| 44848.6875 | 3.94 |
| 44848.697916666664 | 3.6 |
| 44848.708333333336 | 3.55 |
| 44848.71875 | 3.63 |
| 44848.729166666664 | 3.93 |
| 44848.739583333336 | 3.74 |
| 44848.75 | 3.73 |
| 44848.760416666664 | 4.07 |
| 44848.770833333336 | 4.04 |
| 44848.78125 | 4.1 |
| 44848.791666666664 | 4.39 |
| 44848.802083333336 | 4.34 |
| 44848.8125 | 4.42 |
| 44848.822916666664 | 4.5 |
| 44848.833333333336 | 4.83 |
| 44848.84375 | 4.68 |
| 44848.854166666664 | 5 |
| 44848.864583333336 | 5.04 |
| 44848.875 | 5.22 |
| 44848.885416666664 | 5.42 |
| 44848.895833333336 | 5.64 |
| 44848.90625 | 5.52 |
| 44848.916666666664 | 5.77 |
| 44848.927083333336 | 5.99 |
| 44848.9375 | 6.73 |
| 44848.947916666664 | 6.86 |
| 44848.958333333336 | 6.02 |
| 44848.96875 | 6.1 |
| 44848.979166666664 | 6.23 |
| 44848.989583333336 | 6.2 |
| 44849.0 | 5.98 |
| 44849.010416666664 | 6.23 |
| 44849.020833333336 | 5.89 |
| 44849.03125 | 6.2 |
| 44849.041666666664 | 6.41 |
| 44849.052083333336 | 6.55 |
| 44849.0625 | 6.59 |
| 44849.072916666664 | 6.99 |
| 44849.083333333336 | 7.12 |
| 44849.09375 | 6.94 |
| 44849.104166666664 | 6.89 |
| 44849.114583333336 | 6.7 |
| 44849.125 | 6.81 |
| 44849.135416666664 | 6.62 |
| 44849.145833333336 | 6.1 |
| 44849.15625 | 6.25 |
| 44849.166666666664 | 6.53 |
| 44849.177083333336 | 6.48 |
| 44849.1875 | 6.2 |
| 44849.197916666664 | 6.04 |
| 44849.208333333336 | 5.68 |
| 44849.21875 | 5.6 |
| 44849.229166666664 | 5.89 |
| 44849.239583333336 | 5.46 |
| 44849.25 | 5.84 |
| 44849.260416666664 | 5.57 |
| 44849.270833333336 | 5.62 |
| 44849.28125 | 5.78 |
| 44849.291666666664 | 5.62 |
| 44849.302083333336 | 6.03 |
| 44849.3125 | 5.75 |
| 44849.322916666664 | 5.66 |
| 44849.333333333336 | 5.99 |
| 44849.34375 | 6.28 |
| 44849.354166666664 | 6.23 |
| 44849.364583333336 | 6.23 |
| 44849.375 | 6.66 |
| 44849.385416666664 | 6.64 |
| 44849.395833333336 | 6.17 |
| 44849.40625 | 6.03 |
| 44849.416666666664 | 6.38 |
| 44849.427083333336 | 6.11 |
| 44849.4375 | 6.53 |
| 44849.447916666664 | 6.63 |
| 44849.458333333336 | 6.72 |
| 44849.46875 | 6.58 |
| 44849.479166666664 | 6.75 |
| 44849.489583333336 | 6.54 |
| 44849.5 | 6.26 |
| 44849.510416666664 | 6.25 |
| 44849.520833333336 | 6.23 |
| 44849.53125 | 5.99 |
| 44849.541666666664 | 5.9 |
| 44849.552083333336 | 6.37 |
| 44849.5625 | 6.12 |
| 44849.572916666664 | 6.53 |
| 44849.583333333336 | 6.56 |
| 44849.59375 | 6.52 |
| 44849.604166666664 | 6.46 |
| 44849.614583333336 | 6.39 |
| 44849.625 | 6.47 |
| 44849.635416666664 | 6.22 |
| 44849.645833333336 | 7.04 |
| 44849.65625 | 6.81 |
| 44849.666666666664 | 6.49 |
| 44849.677083333336 | 6.4 |
| 44849.6875 | 6.18 |
| 44849.697916666664 | 6.53 |
| 44849.708333333336 | 6.5 |
| 44849.71875 | 6.96 |
| 44849.729166666664 | 6.72 |
| 44849.739583333336 | 5.96 |
| 44849.75 | 6.9 |
| 44849.760416666664 | 7.2 |
| 44849.770833333336 | 7.87 |
| 44849.78125 | 7.48 |
| 44849.791666666664 | 6.77 |
| 44849.802083333336 | 6.72 |
| 44849.8125 | 7.24 |
| 44849.822916666664 | 7.36 |
| 44849.833333333336 | 7.61 |
| 44849.84375 | 7.78 |
| 44849.854166666664 | 8.09 |
| 44849.864583333336 | 8.83 |
| 44849.875 | 9.01 |
| 44849.885416666664 | 8.95 |
| 44849.895833333336 | 9.31 |
| 44849.90625 | 9.06 |
| 44849.916666666664 | 9.56 |
| 44849.927083333336 | 9.69 |
| 44849.9375 | 10.78 |
| 44849.947916666664 | 10.32 |
| 44849.958333333336 | 10.66 |
| 44849.96875 | 10.78 |
| 44849.979166666664 | 10.13 |
| 44849.989583333336 | 10.78 |
| 44850.0 | 10.26 |
| 44850.010416666664 | 10.36 |
| 44850.020833333336 | 10.21 |
| 44850.03125 | 10.24 |
| 44850.041666666664 | 10.48 |
| 44850.052083333336 | 10.19 |
| 44850.0625 | 10.44 |
| 44850.072916666664 | 10.23 |
| 44850.083333333336 | 10.59 |
| 44850.09375 | 10.73 |
| 44850.104166666664 | 10.65 |
| 44850.114583333336 | 10.94 |
| 44850.125 | 10.63 |
| 44850.135416666664 | 10.93 |
| 44850.145833333336 | 8.13 |
| 44850.15625 | 7.86 |
| 44850.166666666664 | 7.75 |
| 44850.177083333336 | 7.98 |
| 44850.1875 | 8.14 |
| 44850.197916666664 | 8.48 |
| 44850.208333333336 | 8.71 |
| 44850.21875 | 8.21 |
| 44850.229166666664 | 8.9 |
| 44850.239583333336 | 7.81 |
| 44850.25 | 8.18 |
| 44850.260416666664 | 7.65 |
| 44850.270833333336 | 8.11 |
| 44850.28125 | 7.93 |
| 44850.291666666664 | 8.35 |
| 44850.302083333336 | 7.86 |
| 44850.3125 | 7.94 |
| 44850.322916666664 | 7.62 |
| 44850.333333333336 | 7.56 |
| 44850.34375 | 7.67 |
| 44850.354166666664 | 7.5 |
| 44850.364583333336 | 7.89 |
| 44850.375 | 8.13 |
| 44850.385416666664 | 7.72 |
| 44850.395833333336 | 8.17 |
| 44850.40625 | 7.93 |
| 44850.416666666664 | 8.09 |
| 44850.427083333336 | 8.13 |
| 44850.4375 | 8.42 |
| 44850.447916666664 | 8.25 |
| 44850.458333333336 | 8.29 |
| 44850.46875 | 8.99 |
| 44850.479166666664 | 8.73 |
| 44850.489583333336 | 9.07 |
| 44850.5 | 8.53 |
| 44850.510416666664 | 9.24 |
| 44850.520833333336 | 9.07 |
| 44850.53125 | 8.8 |
| 44850.541666666664 | 8.63 |
| 44850.552083333336 | 8.92 |
| 44850.5625 | 8.48 |
| 44850.572916666664 | 8.59 |
| 44850.583333333336 | 9.1 |
| 44850.59375 | 8.06 |
| 44850.604166666664 | 7.92 |
| 44850.614583333336 | 7.89 |
| 44850.625 | 8.33 |
| 44850.635416666664 | 7.96 |
| 44850.645833333336 | 8.27 |
| 44850.65625 | 8.34 |
| 44850.666666666664 | 8.36 |
| 44850.677083333336 | 8.81 |
| 44850.6875 | 8.96 |
| 44850.697916666664 | 9.45 |
| 44850.708333333336 | 9.52 |
| 44850.71875 | 10.78 |
| 44850.729166666664 | 10.01 |
| 44850.739583333336 | 10.15 |
| 44850.75 | 10.96 |
| 44850.760416666664 | 11.23 |
| 44850.770833333336 | 11.57 |
| 44850.78125 | 11.26 |
| 44850.791666666664 | 12.06 |
| 44850.802083333336 | 10.92 |
| 44850.8125 | 10.89 |
| 44850.822916666664 | 10.24 |
| 44850.833333333336 | 10.34 |
| 44850.84375 | 9.91 |
| 44850.854166666664 | 9.67 |
| 44850.864583333336 | 9.82 |
| 44850.875 | 9.76 |
| 44850.885416666664 | 9.52 |
| 44850.895833333336 | 9.75 |
| 44850.90625 | 6.85 |
| 44850.916666666664 | 7.03 |
| 44850.927083333336 | 7.05 |
| 44850.9375 | 7.03 |
| 44850.947916666664 | 7.53 |
| 44850.958333333336 | 7.81 |
| 44850.96875 | 8.07 |
| 44850.979166666664 | 8.26 |
| 44850.989583333336 | 7.73 |
| 44851.0 | 8.4 |
| 44851.010416666664 | 8.33 |
| 44851.020833333336 | 8.07 |
| 44851.03125 | 7.78 |
| 44851.041666666664 | 7.88 |
| 44851.052083333336 | 7.68 |
| 44851.0625 | 8.26 |
| 44851.072916666664 | 7.95 |
| 44851.083333333336 | 7.65 |
| 44851.09375 | 8.13 |
| 44851.104166666664 | 8.43 |
| 44851.114583333336 | 8.52 |
| 44851.125 | 8.87 |
| 44851.135416666664 | 8.81 |
| 44851.145833333336 | 9.07 |
| 44851.15625 | 9.01 |
| 44851.166666666664 | 8.95 |
| 44851.177083333336 | 9 |
| 44851.1875 | 9.41 |
| 44851.197916666664 | 9.22 |
| 44851.208333333336 | 8.91 |
| 44851.21875 | 9.46 |
| 44851.229166666664 | 8.99 |
| 44851.239583333336 | 8.63 |
| 44851.25 | 8.98 |
| 44851.260416666664 | 9.09 |
| 44851.270833333336 | 8.67 |
| 44851.28125 | 8.32 |
| 44851.291666666664 | 8.46 |
| 44851.302083333336 | 8.63 |
| 44851.3125 | 8.7 |
| 44851.322916666664 | 8.75 |
| 44851.333333333336 | 9.47 |
| 44851.34375 | 8.52 |
| 44851.354166666664 | 8 |
| 44851.364583333336 | 8.01 |
| 44851.375 | 7.85 |
| 44851.385416666664 | 7.89 |
| 44851.395833333336 | 7.98 |
| 44851.40625 | 8.06 |
| 44851.416666666664 | 8.32 |
| 44851.427083333336 | 7.62 |
| 44851.4375 | 7.92 |
| 44851.447916666664 | 7.94 |
| 44851.458333333336 | 8.29 |
| 44851.46875 | 8.12 |
| 44851.479166666664 | 7.97 |
| 44851.489583333336 | 7.66 |
| 44851.5 | 7.12 |
| 44851.510416666664 | 7.39 |
| 44851.520833333336 | 7.24 |
| 44851.53125 | 7.45 |
| 44851.541666666664 | 6.99 |
| 44851.552083333336 | 7.48 |
| 44851.5625 | 7.37 |
| 44851.572916666664 | 7.18 |
| 44851.583333333336 | 7.1 |
| 44851.59375 | 6.87 |
| 44851.604166666664 | 7.5 |
| 44851.614583333336 | 7.13 |
| 44851.625 | 8.11 |
| 44851.635416666664 | 7.6 |
| 44851.645833333336 | 7.18 |
| 44851.65625 | 7.45 |
| 44851.666666666664 | 7.38 |
| 44851.677083333336 | 7.48 |
| 44851.6875 | 7.63 |
| 44851.697916666664 | 7.94 |
| 44851.708333333336 | 7.68 |
| 44851.71875 | 7.61 |
| 44851.729166666664 | 7.85 |
| 44851.739583333336 | 7.94 |
| 44851.75 | 8.43 |
| 44851.760416666664 | 7.73 |
| 44851.770833333336 | 8.73 |
| 44851.78125 | 8.64 |
| 44851.791666666664 | 8.65 |
| 44851.802083333336 | 7.96 |
| 44851.8125 | 8.31 |
| 44851.822916666664 | 8.67 |
| 44851.833333333336 | 8.83 |
| 44851.84375 | 8.3 |
| 44851.854166666664 | 7.72 |
| 44851.864583333336 | 8.05 |
| 44851.875 | 8.16 |
| 44851.885416666664 | 8.71 |
| 44851.895833333336 | 8.88 |
| 44851.90625 | 9.06 |
| 44851.916666666664 | 9.03 |
| 44851.927083333336 | 9.23 |
| 44851.9375 | 8.73 |
| 44851.947916666664 | 9.02 |
| 44851.958333333336 | 9.23 |
| 44851.96875 | 8.62 |
| 44851.979166666664 | 8.95 |
| 44851.989583333336 | 9.02 |
| 44852.0 | 9.34 |
| 44852.010416666664 | 9.29 |
| 44852.020833333336 | 9.36 |
| 44852.03125 | 9.52 |
| 44852.041666666664 | 9.64 |
| 44852.052083333336 | 9.65 |
| 44852.0625 | 9.98 |
| 44852.072916666664 | 9.43 |
| 44852.083333333336 | 9.57 |
| 44852.09375 | 9.43 |
| 44852.104166666664 | 9.43 |
| 44852.114583333336 | 9.52 |
| 44852.125 | 9.64 |
| 44852.135416666664 | 9.48 |
| 44852.145833333336 | 8.97 |
| 44852.15625 | 9.49 |
| 44852.166666666664 | 5.01 |
| 44852.177083333336 | 5.06 |
| 44852.1875 | 5.09 |
| 44852.197916666664 | 5.36 |
| 44852.208333333336 | 5.03 |
| 44852.21875 | 5.21 |
| 44852.229166666664 | 5.23 |
| 44852.239583333336 | 5.16 |
| 44852.25 | 5.16 |
| 44852.260416666664 | 5.27 |
| 44852.270833333336 | 5.16 |
| 44852.28125 | 5.14 |
| 44852.291666666664 | 5.01 |
| 44852.302083333336 | 4.95 |
| 44852.3125 | 4.83 |
| 44852.322916666664 | 5.04 |
| 44852.333333333336 | 4.98 |
| 44852.34375 | 5.07 |
| 44852.354166666664 | 5.23 |
| 44852.364583333336 | 5.13 |
| 44852.375 | 4.91 |
| 44852.385416666664 | 5.29 |
| 44852.395833333336 | 5.31 |
| 44852.40625 | 5.23 |
| 44852.416666666664 | 5.35 |
| 44852.427083333336 | 5.24 |
| 44852.4375 | 4.95 |
| 44852.447916666664 | 5.05 |
| 44852.458333333336 | 4.9 |
| 44852.46875 | 5.26 |
| 44852.479166666664 | 5.34 |
| 44852.489583333336 | 5.08 |
| 44852.5 | 4.9 |
| 44852.510416666664 | 5.22 |
| 44852.520833333336 | 5.22 |
| 44852.53125 | 5.5 |
| 44852.541666666664 | 5.69 |
| 44852.552083333336 | 5.87 |
| 44852.5625 | 5.8 |
| 44852.572916666664 | 5.99 |
| 44852.583333333336 | 5.8 |
| 44852.59375 | 5.87 |
| 44852.604166666664 | 5.98 |
| 44852.614583333336 | 6.43 |
| 44852.625 | 6.38 |
| 44852.635416666664 | 6.41 |
| 44852.645833333336 | 6.43 |
| 44852.65625 | 6.75 |
| 44852.666666666664 | 6.95 |
| 44852.677083333336 | 7.48 |
| 44852.6875 | 7.23 |
| 44852.697916666664 | 7.67 |
| 44852.708333333336 | 7.15 |
| 44852.71875 | 7.39 |
| 44852.729166666664 | 7.71 |
| 44852.739583333336 | 7.79 |
| 44852.75 | 7.78 |
| 44852.760416666664 | 7.79 |
| 44852.770833333336 | 7.17 |
| 44852.78125 | 7.53 |
| 44852.791666666664 | 7.48 |
| 44852.802083333336 | 7.95 |
| 44852.8125 | 8.1 |
| 44852.822916666664 | 8.81 |
| 44852.833333333336 | 7.78 |
| 44852.84375 | 8.39 |
| 44852.854166666664 | 7.73 |
| 44852.864583333336 | 8.06 |
| 44852.875 | 8.37 |
| 44852.885416666664 | 7.62 |
| 44852.895833333336 | 7.99 |
| 44852.90625 | 8.19 |
| 44852.916666666664 | 8.03 |
| 44852.927083333336 | 8.28 |
| 44852.9375 | 8.61 |
| 44852.947916666664 | 8.87 |
| 44852.958333333336 | 8.92 |
| 44852.96875 | 8.65 |
| 44852.979166666664 | 8.65 |
| 44852.989583333336 | 8.71 |
| 44853.0 | 8.88 |
| 44853.010416666664 | 8.79 |
| 44853.020833333336 | 8.83 |
| 44853.03125 | 8.6 |
| 44853.041666666664 | 8.81 |
| 44853.052083333336 | 8.32 |
| 44853.0625 | 8.72 |
| 44853.072916666664 | 8.8 |
| 44853.083333333336 | 8.93 |
| 44853.09375 | 8.91 |
| 44853.104166666664 | 8.8 |
| 44853.114583333336 | 8.79 |
| 44853.125 | 8.94 |
| 44853.135416666664 | 8.43 |
| 44853.145833333336 | 8.38 |
| 44853.15625 | 8.38 |
| 44853.166666666664 | 8.13 |
| 44853.177083333336 | 8.24 |
| 44853.1875 | 8.54 |
| 44853.197916666664 | 8.71 |
| 44853.208333333336 | 8.75 |
| 44853.21875 | 8.96 |
| 44853.229166666664 | 8.7 |
| 44853.239583333336 | 8.81 |
| 44853.25 | 8.86 |
| 44853.260416666664 | 8.89 |
| 44853.270833333336 | 8.93 |
| 44853.28125 | 9.01 |
| 44853.291666666664 | 8.96 |
| 44853.302083333336 | 9.08 |
| 44853.3125 | 9.16 |
| 44853.322916666664 | 9.07 |
| 44853.333333333336 | 8.92 |
| 44853.34375 | 9.35 |
| 44853.354166666664 | 8.95 |
| 44853.364583333336 | 9 |
| 44853.375 | 9.14 |
| 44853.385416666664 | 9.05 |
| 44853.395833333336 | 9.43 |
| 44853.40625 | 9.12 |
| 44853.416666666664 | 8.97 |
| 44853.427083333336 | 8.75 |
| 44853.4375 | 8.98 |
| 44853.447916666664 | 9.03 |
| 44853.458333333336 | 8.89 |
| 44853.46875 | 9.13 |
| 44853.479166666664 | 8.95 |
| 44853.489583333336 | 8.53 |
| 44853.5 | 8.54 |
| 44853.510416666664 | 8.69 |
| 44853.520833333336 | 8.58 |
| 44853.53125 | 8.91 |
| 44853.541666666664 | 8.95 |
| 44853.552083333336 | 8.97 |
| 44853.5625 | 9.19 |
| 44853.572916666664 | 9.64 |
| 44853.583333333336 | 9.99 |
| 44853.59375 | 9.97 |
| 44853.604166666664 | 10.54 |
| 44853.614583333336 | 10.82 |
| 44853.625 | 10.81 |
| 44853.635416666664 | 10.54 |
| 44853.645833333336 | 10.85 |
| 44853.65625 | 11.1 |
| 44853.666666666664 | 11.32 |
| 44853.677083333336 | 11.86 |
| 44853.6875 | 11.77 |
| 44853.697916666664 | 12.55 |
| 44853.708333333336 | 11.94 |
| 44853.71875 | 11.78 |
| 44853.729166666664 | 12.27 |
| 44853.739583333336 | 13.27 |
| 44853.75 | 12.82 |
| 44853.760416666664 | 12.4 |
| 44853.770833333336 | 12.85 |
| 44853.78125 | 12.37 |
| 44853.791666666664 | 12.38 |
| 44853.802083333336 | 13.29 |
| 44853.8125 | 12.67 |
| 44853.822916666664 | 12.99 |
| 44853.833333333336 | 13.43 |
| 44853.84375 | 11.79 |
| 44853.854166666664 | 11.65 |
| 44853.864583333336 | 11.94 |
| 44853.875 | 11.77 |
| 44853.885416666664 | 11.65 |
| 44853.895833333336 | 11.84 |
| 44853.90625 | 11.59 |
| 44853.916666666664 | 11.66 |
| 44853.927083333336 | 11.66 |
| 44853.9375 | 11.93 |
| 44853.947916666664 | 12.14 |
| 44853.958333333336 | 11.85 |
| 44853.96875 | 12.43 |
| 44853.979166666664 | 12.74 |
| 44853.989583333336 | 12.85 |
| 44854.0 | 12.35 |
| 44854.010416666664 | 12.59 |
| 44854.020833333336 | 12.75 |
| 44854.03125 | 12.63 |
| 44854.041666666664 | 12.21 |
| 44854.052083333336 | 12.43 |
| 44854.0625 | 12.98 |
| 44854.072916666664 | 12.4 |
| 44854.083333333336 | 12.64 |
| 44854.09375 | 12.82 |
| 44854.104166666664 | 12.79 |
| 44854.114583333336 | 13.61 |
| 44854.125 | 13.26 |
| 44854.135416666664 | 12.99 |
| 44854.145833333336 | 13.26 |
| 44854.15625 | 12.5 |
| 44854.166666666664 | 12.59 |
| 44854.177083333336 | 12.5 |
| 44854.1875 | 12.67 |
| 44854.197916666664 | 12.68 |
| 44854.208333333336 | 12.57 |
| 44854.21875 | 12.79 |
| 44854.229166666664 | 12.75 |
| 44854.239583333336 | 12.86 |
| 44854.25 | 13.02 |
| 44854.260416666664 | 13.16 |
| 44854.270833333336 | 13.17 |
| 44854.28125 | 13.38 |
| 44854.291666666664 | 13.18 |
| 44854.302083333336 | 13.32 |
| 44854.3125 | 13.11 |
| 44854.322916666664 | 12.96 |
| 44854.333333333336 | 13.36 |
| 44854.34375 | 13.25 |
| 44854.354166666664 | 13.23 |
| 44854.364583333336 | 13.22 |
| 44854.375 | 13.49 |
| 44854.385416666664 | 13.17 |
| 44854.395833333336 | 13.58 |
| 44854.40625 | 13.06 |
| 44854.416666666664 | 12.68 |
| 44854.427083333336 | 12.44 |
| 44854.4375 | 12.36 |
| 44854.447916666664 | 12.69 |
| 44854.458333333336 | 12.24 |
| 44854.46875 | 12.54 |
| 44854.479166666664 | 12.7 |
| 44854.489583333336 | 12.59 |
| 44854.5 | 12.78 |
| 44854.510416666664 | 13.19 |
| 44854.520833333336 | 12.89 |
| 44854.53125 | 13.24 |
| 44854.541666666664 | 13.49 |
| 44854.552083333336 | 13.34 |
| 44854.5625 | 13.44 |
| 44854.572916666664 | 13.14 |
| 44854.583333333336 | 13.27 |
| 44854.59375 | 13.63 |
| 44854.604166666664 | 14.05 |
| 44854.614583333336 | 13.73 |
| 44854.625 | 14.05 |
| 44854.635416666664 | 13.83 |
| 44854.645833333336 | 13.89 |
| 44854.65625 | 14.26 |
| 44854.666666666664 | 14.19 |
| 44854.677083333336 | 14.44 |
| 44854.6875 | 14.75 |
| 44854.697916666664 | 14.86 |
| 44854.708333333336 | 15.44 |
| 44854.71875 | 15.15 |
| 44854.729166666664 | 14.98 |
| 44854.739583333336 | 14.5 |
| 44854.75 | 14.57 |
| 44854.760416666664 | 14.75 |
| 44854.770833333336 | 14.33 |
| 44854.78125 | 14.21 |
| 44854.791666666664 | 14.39 |
| 44854.802083333336 | 14.4 |
| 44854.8125 | 14.91 |
| 44854.822916666664 | 15.37 |
| 44854.833333333336 | 15.93 |
| 44854.84375 | 15.4 |
| 44854.854166666664 | 16.08 |
| 44854.864583333336 | 16.57 |
| 44854.875 | 16.49 |
| 44854.885416666664 | 16.24 |
| 44854.895833333336 | 15.77 |
| 44854.90625 | 15.86 |
| 44854.916666666664 | 16.21 |
| 44854.927083333336 | 16.62 |
| 44854.9375 | 16.93 |
| 44854.947916666664 | 17.16 |
| 44854.958333333336 | 17.57 |
| 44854.96875 | 16.97 |
| 44854.979166666664 | 16.95 |
| 44854.989583333336 | 16.9 |
| 44855.0 | 17.18 |
| 44855.010416666664 | 17.27 |
| 44855.020833333336 | 17.55 |
| 44855.03125 | 17.42 |
| 44855.041666666664 | 17.37 |
| 44855.052083333336 | 17.06 |
| 44855.0625 | 16.78 |
| 44855.072916666664 | 16.67 |
| 44855.083333333336 | 17.14 |
| 44855.09375 | 17.09 |
| 44855.104166666664 | 17.61 |
| 44855.114583333336 | 15.58 |
| 44855.125 | 15.93 |
| 44855.135416666664 | 16.49 |
| 44855.145833333336 | 16 |
| 44855.15625 | 15.87 |
| 44855.166666666664 | 15.9 |
| 44855.177083333336 | 16.41 |
| 44855.1875 | 15.31 |
| 44855.197916666664 | 15.17 |
| 44855.208333333336 | 15.01 |
| 44855.21875 | 14.91 |
| 44855.229166666664 | 15.11 |
| 44855.239583333336 | 15.19 |
| 44855.25 | 15.03 |
| 44855.260416666664 | 15.04 |
| 44855.270833333336 | 14.98 |
| 44855.28125 | 15.32 |
| 44855.291666666664 | 15.24 |
| 44855.302083333336 | 15.14 |
| 44855.3125 | 15.39 |
| 44855.322916666664 | 15.38 |
| 44855.333333333336 | 15.42 |
| 44855.34375 | 15.55 |
| 44855.354166666664 | 15.71 |
| 44855.364583333336 | 15.5 |
| 44855.375 | 15.63 |
| 44855.385416666664 | 15.23 |
| 44855.395833333336 | 15.01 |
| 44855.40625 | 18.27 |
| 44855.416666666664 | 14.29 |
| 44855.427083333336 | 14.18 |
| 44855.4375 | 13.86 |
| 44855.447916666664 | 14.06 |
| 44855.458333333336 | 13.72 |
| 44855.46875 | 14.04 |
| 44855.479166666664 | 14.34 |
| 44855.489583333336 | 14.54 |
| 44855.5 | 14.56 |
| 44855.510416666664 | 14.17 |
| 44855.520833333336 | 14.69 |
| 44855.53125 | 15.57 |
| 44855.541666666664 | 16.02 |
| 44855.552083333336 | 16.25 |
| 44855.5625 | 16.41 |
| 44855.572916666664 | 16.59 |
| 44855.583333333336 | 17.1 |
| 44855.59375 | 17.23 |
| 44855.604166666664 | 17.87 |
| 44855.614583333336 | 17.34 |
| 44855.625 | 17.56 |
| 44855.635416666664 | 17.89 |
| 44855.645833333336 | 18.77 |
| 44855.65625 | 19.18 |
| 44855.666666666664 | 19.28 |
| 44855.677083333336 | 19.49 |
| 44855.6875 | 20.09 |
| 44855.697916666664 | 20.37 |
| 44855.708333333336 | 20.12 |
| 44855.71875 | 20.81 |
| 44855.729166666664 | 20.69 |
| 44855.739583333336 | 21.13 |
| 44855.75 | 20.53 |
| 44855.760416666664 | 20.55 |
| 44855.770833333336 | 20.36 |
| 44855.78125 | 19.82 |
| 44855.791666666664 | 20.2 |
| 44855.802083333336 | 19.81 |
| 44855.8125 | 20.63 |
| 44855.822916666664 | 20.27 |
| 44855.833333333336 | 20.48 |
| 44855.84375 | 20.43 |
| 44855.854166666664 | 19.64 |
| 44855.864583333336 | 19.21 |
| 44855.875 | 19.4 |
| 44855.885416666664 | 19.58 |
| 44855.895833333336 | 19.09 |
| 44855.90625 | 19.51 |
| 44855.916666666664 | 19.75 |
| 44855.927083333336 | 19.75 |
| 44855.9375 | 19.91 |
| 44855.947916666664 | 19.93 |
| 44855.958333333336 | 19.21 |
| 44855.96875 | 19.83 |
| 44855.979166666664 | 18.97 |
| 44855.989583333336 | 18.7 |
| 44856.0 | 18.67 |
| 44856.010416666664 | 18.69 |
| 44856.020833333336 | 18.81 |
| 44856.03125 | 18.97 |
| 44856.041666666664 | 19.18 |
| 44856.052083333336 | 19.1 |
| 44856.0625 | 19.24 |
| 44856.072916666664 | 19.58 |
| 44856.083333333336 | 19.68 |
| 44856.09375 | 19.88 |
| 44856.104166666664 | 19.68 |
| 44856.114583333336 | 19.57 |
| 44856.125 | 19.64 |
| 44856.135416666664 | 19.85 |
| 44856.145833333336 | 19.83 |
| 44856.15625 | 20.56 |
| 44856.166666666664 | 20.51 |
| 44856.177083333336 | 20.96 |
| 44856.1875 | 20.43 |
| 44856.197916666664 | 20.37 |
| 44856.208333333336 | 20.17 |
| 44856.21875 | 20.41 |
| 44856.229166666664 | 20.43 |
| 44856.239583333336 | 20.67 |
| 44856.25 | 20.61 |
| 44856.260416666664 | 20.8 |
| 44856.270833333336 | 20.73 |
| 44856.28125 | 20.72 |
| 44856.291666666664 | 20.79 |
| 44856.302083333336 | 20.6 |
| 44856.3125 | 20.85 |
| 44856.322916666664 | 20.8 |
| 44856.333333333336 | 20.75 |
| 44856.34375 | 20.71 |
| 44856.354166666664 | 20.62 |
| 44856.364583333336 | 20.47 |
| 44856.375 | 20.64 |
| 44856.385416666664 | 20.58 |
| 44856.395833333336 | 20.75 |
| 44856.40625 | 20.22 |
| 44856.416666666664 | 20.13 |
| 44856.427083333336 | 20.57 |
| 44856.4375 | 20.35 |
| 44856.447916666664 | 20.39 |
| 44856.458333333336 | 20.21 |
| 44856.46875 | 19.25 |
| 44856.479166666664 | 20.02 |
| 44856.489583333336 | 19.57 |
| 44856.5 | 19.46 |
| 44856.510416666664 | 19.52 |
| 44856.520833333336 | 20.14 |
| 44856.53125 | 20.52 |
| 44856.541666666664 | 21.79 |
| 44856.552083333336 | 21.49 |
| 44856.5625 | 21.63 |
| 44856.572916666664 | 21.65 |
| 44856.583333333336 | 21.68 |
| 44856.59375 | 22.84 |
| 44856.604166666664 | 22.8 |
| 44856.614583333336 | 22.99 |
| 44856.625 | 23.03 |
| 44856.635416666664 | 23.21 |
| 44856.645833333336 | 23.34 |
| 44856.65625 | 22.47 |
| 44856.666666666664 | 23.45 |
| 44856.677083333336 | 24.26 |
| 44856.6875 | 24.61 |
| 44856.697916666664 | 25.33 |
| 44856.708333333336 | 25.24 |
| 44856.71875 | 25.59 |
| 44856.729166666664 | 26.62 |
| 44856.739583333336 | 26.86 |
| 44856.75 | 27.37 |
| 44856.760416666664 | 27.8 |
| 44856.770833333336 | 27.86 |
| 44856.78125 | 28.13 |
| 44856.791666666664 | 29.27 |
| 44856.802083333336 | 29.63 |
| 44856.8125 | 29.08 |
| 44856.822916666664 | 29.24 |
| 44856.833333333336 | 28.69 |
| 44856.84375 | 28.27 |
| 44856.854166666664 | 29.05 |
| 44856.864583333336 | 28.94 |
| 44856.875 | 29.04 |
| 44856.885416666664 | 28.59 |
| 44856.895833333336 | 28.95 |
| 44856.90625 | 29.44 |
| 44856.916666666664 | 29.41 |
| 44856.927083333336 | 29.8 |
| 44856.9375 | 29.35 |
| 44856.947916666664 | 29.32 |
| 44856.958333333336 | 28.93 |
| 44856.96875 | 28.51 |
| 44856.979166666664 | 27.53 |
| 44856.989583333336 | 27.3 |
| 44857.0 | 27.47 |
| 44857.010416666664 | 27.64 |
| 44857.020833333336 | 27.45 |
| 44857.03125 | 28.03 |
| 44857.041666666664 | 26.55 |
| 44857.052083333336 | 26.48 |
| 44857.0625 | 26.5 |
| 44857.072916666664 | 27.11 |
| 44857.083333333336 | 26.94 |
| 44857.09375 | 27.08 |
| 44857.104166666664 | 28.89 |
| 44857.114583333336 | 27.53 |
| 44857.125 | 27.53 |
| 44857.135416666664 | 27.17 |
| 44857.145833333336 | 27.56 |
| 44857.15625 | 28.24 |
| 44857.166666666664 | 27.75 |
| 44857.177083333336 | 27.63 |
| 44857.1875 | 27.73 |
| 44857.197916666664 | 27.42 |
| 44857.208333333336 | 28.07 |
| 44857.21875 | 28.01 |
| 44857.229166666664 | 27.54 |
| 44857.239583333336 | 27.67 |
| 44857.25 | 27.5 |
| 44857.260416666664 | 27.48 |
| 44857.270833333336 | 28.22 |
| 44857.28125 | 28.03 |
| 44857.291666666664 | 28.35 |
| 44857.302083333336 | 28.2 |
| 44857.3125 | 27.88 |
| 44857.322916666664 | 28.08 |
| 44857.333333333336 | 27.4 |
| 44857.34375 | 27.57 |
| 44857.354166666664 | 27.77 |
| 44857.364583333336 | 27.6 |
| 44857.375 | 27.98 |
| 44857.385416666664 | 27.85 |
| 44857.395833333336 | 27.88 |
| 44857.40625 | 28.27 |
| 44857.416666666664 | 28.59 |
| 44857.427083333336 | 28.45 |
| 44857.4375 | 28.47 |
| 44857.447916666664 | 28.68 |
| 44857.458333333336 | 28.97 |
| 44857.46875 | 29.27 |
| 44857.479166666664 | 29.39 |
| 44857.489583333336 | 29.26 |
| 44857.5 | 30.22 |
| 44857.510416666664 | 29.66 |
| 44857.520833333336 | 29.41 |
| 44857.53125 | 29.43 |
| 44857.541666666664 | 28.98 |
| 44857.552083333336 | 29.93 |
| 44857.5625 | 29.99 |
| 44857.572916666664 | 30.39 |
| 44857.583333333336 | 29.99 |
| 44857.59375 | 30.6 |
| 44857.604166666664 | 32.85 |
| 44857.614583333336 | 32.24 |
| 44857.625 | 31.33 |
| 44857.635416666664 | 30.4 |
| 44857.645833333336 | 32 |
| 44857.65625 | 31.63 |
| 44857.666666666664 | 31.86 |
| 44857.677083333336 | 33.23 |
| 44857.6875 | 34.36 |
| 44857.697916666664 | 35.35 |
| 44857.708333333336 | 36.84 |
| 44857.71875 | 36.13 |
| 44857.729166666664 | 36.54 |
| 44857.739583333336 | 37.9 |
| 44857.75 | 37.85 |
| 44857.760416666664 | 38.93 |
| 44857.770833333336 | 37.25 |
| 44857.78125 | 37.66 |
| 44857.791666666664 | 38.21 |
| 44857.802083333336 | 38.33 |
| 44857.8125 | 38.62 |
| 44857.822916666664 | 37.99 |
| 44857.833333333336 | 37.92 |
| 44857.84375 | 37.42 |
| 44857.854166666664 | 36.99 |
| 44857.864583333336 | 37.9 |
| 44857.875 | 36.32 |
| 44857.885416666664 | 35.71 |
| 44857.895833333336 | 36.13 |
| 44857.90625 | 35.45 |
| 44857.916666666664 | 35.87 |
| 44857.927083333336 | 35.22 |
| 44857.9375 | 35.54 |
| 44857.947916666664 | 35.56 |
| 44857.958333333336 | 35.27 |
| 44857.96875 | 35.01 |
| 44857.979166666664 | 34.37 |
| 44857.989583333336 | 34.35 |
| 44858.0 | 34.05 |
| 44858.010416666664 | 34 |
| 44858.020833333336 | 33.85 |
| 44858.03125 | 34.05 |
| 44858.041666666664 | 33.31 |
| 44858.052083333336 | 33.66 |
| 44858.0625 | 32.85 |
| 44858.072916666664 | 32.78 |
| 44858.083333333336 | 33.06 |
| 44858.09375 | 33.3 |
| 44858.104166666664 | 33.16 |
| 44858.114583333336 | 32.71 |
| 44858.125 | 32.63 |
| 44858.135416666664 | 32.38 |
| 44858.145833333336 | 32.36 |
| 44858.15625 | 31.98 |
| 44858.166666666664 | 32.01 |
| 44858.177083333336 | 32.26 |
| 44858.1875 | 32.36 |
| 44858.197916666664 | 32.62 |
| 44858.208333333336 | 32.56 |
| 44858.21875 | 33.01 |
| 44858.229166666664 | 32.84 |
| 44858.239583333336 | 33.42 |
| 44858.25 | 33.96 |
| 44858.260416666664 | 33.78 |
| 44858.270833333336 | 33.55 |
| 44858.28125 | 33.31 |
| 44858.291666666664 | 32.81 |
| 44858.302083333336 | 32.98 |
| 44858.3125 | 33.45 |
| 44858.322916666664 | 33.88 |
| 44858.333333333336 | 33.36 |
| 44858.34375 | 33.23 |
| 44858.354166666664 | 33.14 |
| 44858.364583333336 | 32.28 |
| 44858.375 | 31.63 |
| 44858.385416666664 | 31.23 |
| 44858.395833333336 | 32.07 |
| 44858.40625 | 31.95 |
| 44858.416666666664 | 32.93 |
| 44858.427083333336 | 32.53 |
| 44858.4375 | 32.9 |
| 44858.447916666664 | 33.04 |
| 44858.458333333336 | 33.43 |
| 44858.46875 | 33.54 |
| 44858.479166666664 | 34.34 |
| 44858.489583333336 | 34.6 |
| 44858.5 | 35.13 |
| 44858.510416666664 | 35.32 |
| 44858.520833333336 | 34.62 |
| 44858.53125 | 34.71 |
| 44858.541666666664 | 34.33 |
| 44858.552083333336 | 33.96 |
| 44858.5625 | 34.85 |
| 44858.572916666664 | 35.23 |
| 44858.583333333336 | 34.54 |
| 44858.59375 | 34.63 |
| 44858.604166666664 | 35.61 |
| 44858.614583333336 | 34.41 |
| 44858.625 | 35.35 |
| 44858.635416666664 | 34.82 |
| 44858.645833333336 | 41.99 |
| 44858.65625 | 32.92 |
| 44858.666666666664 | 34.82 |
| 44858.677083333336 | 34.63 |
| 44858.6875 | 34.95 |
| 44858.697916666664 | 35.17 |
| 44858.708333333336 | 35.85 |
| 44858.71875 | 36.95 |
| 44858.729166666664 | 35.91 |
| 44858.739583333336 | 37.77 |
| 44858.75 | 39.13 |
| 44858.760416666664 | 38.98 |
| 44858.770833333336 | 40.37 |
| 44858.78125 | 40.74 |
| 44858.791666666664 | 39.23 |
| 44858.802083333336 | 39.15 |
| 44858.8125 | 36.79 |
| 44858.822916666664 | 36.67 |
| 44858.833333333336 | 36.94 |
| 44858.84375 | 36.4 |
| 44858.854166666664 | 36.43 |
| 44858.864583333336 | 34.95 |
| 44858.875 | 33.78 |
| 44858.885416666664 | 33.65 |
| 44858.895833333336 | 33.02 |
| 44858.90625 | 33.13 |
| 44858.916666666664 | 32.56 |
| 44858.927083333336 | 33.52 |
| 44858.9375 | 34.18 |
| 44858.947916666664 | 33.54 |
| 44858.958333333336 | 34.1 |
| 44858.96875 | 34.17 |
| 44858.979166666664 | 34.61 |
| 44858.989583333336 | 33.78 |
| 44859.0 | 33.87 |
| 44859.010416666664 | 34.28 |
| 44859.020833333336 | 33.63 |
| 44859.03125 | 33.48 |
| 44859.041666666664 | 33.16 |
| 44859.052083333336 | 33.5 |
| 44859.0625 | 32.86 |
| 44859.072916666664 | 32.89 |
| 44859.083333333336 | 33.31 |
| 44859.09375 | 32.96 |
| 44859.104166666664 | 32.85 |
| 44859.114583333336 | 33 |
| 44859.125 | 33.04 |
| 44859.135416666664 | 32.75 |
| 44859.145833333336 | 33.01 |
| 44859.15625 | 33.14 |
| 44859.166666666664 | 33.27 |
| 44859.177083333336 | 33.15 |
| 44859.1875 | 33.33 |
| 44859.197916666664 | 32.22 |
| 44859.208333333336 | 32.23 |
| 44859.21875 | 31.61 |
| 44859.229166666664 | 31.49 |
| 44859.239583333336 | 31.73 |
| 44859.25 | 31.47 |
| 44859.260416666664 | 31.3 |
| 44859.270833333336 | 31.54 |
| 44859.28125 | 31.35 |
| 44859.291666666664 | 30.51 |
| 44859.302083333336 | 31.18 |
| 44859.3125 | 31.02 |
| 44859.322916666664 | 31.29 |
| 44859.333333333336 | 31.01 |
| 44859.34375 | 31.39 |
| 44859.354166666664 | 31.66 |
| 44859.364583333336 | 31.46 |
| 44859.375 | 30.91 |
| 44859.385416666664 | 31.02 |
| 44859.395833333336 | 31.58 |
| 44859.40625 | 31.65 |
| 44859.416666666664 | 31.41 |
| 44859.427083333336 | 31.13 |
| 44859.4375 | 31.08 |
| 44859.447916666664 | 31.16 |
| 44859.458333333336 | 30.91 |
| 44859.46875 | 31.54 |
| 44859.479166666664 | 31.99 |
| 44859.489583333336 | 32.58 |
| 44859.5 | 32.21 |
| 44859.510416666664 | 32.89 |
| 44859.520833333336 | 32.13 |
| 44859.53125 | 32.4 |
| 44859.541666666664 | 32.33 |
| 44859.552083333336 | 32.63 |
| 44859.5625 | 32.93 |
| 44859.572916666664 | 31.89 |
| 44859.583333333336 | 31.29 |
| 44859.59375 | 32.76 |
| 44859.604166666664 | 32.13 |
| 44859.614583333336 | 31.97 |
| 44859.625 | 32.39 |
| 44859.635416666664 | 31.44 |
| 44859.645833333336 | 31.4 |
| 44859.65625 | 32.37 |
| 44859.666666666664 | 30.77 |
| 44859.677083333336 | 31.55 |
| 44859.6875 | 31.46 |
| 44859.697916666664 | 31.69 |
| 44859.708333333336 | 30.32 |
| 44859.71875 | 31.29 |
| 44859.729166666664 | 32.4 |
| 44859.739583333336 | 31.57 |
| 44859.75 | 30.69 |
| 44859.760416666664 | 31.46 |
| 44859.770833333336 | 32.07 |
| 44859.78125 | 33.02 |
| 44859.791666666664 | 32.99 |
| 44859.802083333336 | 32.8 |
| 44859.8125 | 33.79 |
| 44859.822916666664 | 32.42 |
| 44859.833333333336 | 31.25 |
| 44859.84375 | 32.78 |
| 44859.854166666664 | 31.2 |
| 44859.864583333336 | 32.29 |
| 44859.875 | 32.68 |
| 44859.885416666664 | 32.39 |
| 44859.895833333336 | 32.36 |
| 44859.90625 | 32.04 |
| 44859.916666666664 | 32.09 |
| 44859.927083333336 | 31.26 |
| 44859.9375 | 31.62 |
| 44859.947916666664 | 31.12 |
| 44859.958333333336 | 30.65 |
| 44859.96875 | 30.64 |
| 44859.979166666664 | 30.25 |
| 44859.989583333336 | 29.76 |
| 44860.0 | 30.68 |
| 44860.010416666664 | 29.75 |
| 44860.020833333336 | 30.74 |
| 44860.03125 | 31.46 |
| 44860.041666666664 | 31.67 |
| 44860.052083333336 | 30.92 |
| 44860.0625 | 30.57 |
| 44860.072916666664 | 30.15 |
| 44860.083333333336 | 29.63 |
| 44860.09375 | 29.62 |
| 44860.104166666664 | 29.26 |
| 44860.114583333336 | 29.14 |
| 44860.125 | 29.04 |
| 44860.135416666664 | 28.56 |
| 44860.145833333336 | 28.28 |
| 44860.15625 | 28.32 |
| 44860.166666666664 | 28.54 |
| 44860.177083333336 | 28.4 |
| 44860.1875 | 28.15 |
| 44860.197916666664 | 28 |
| 44860.208333333336 | 27.6 |
| 44860.21875 | 27.96 |
| 44860.229166666664 | 27.57 |
| 44860.239583333336 | 27.16 |
| 44860.25 | 27.29 |
| 44860.260416666664 | 27.2 |
| 44860.270833333336 | 27.43 |
| 44860.28125 | 27.35 |
| 44860.291666666664 | 25.1 |
| 44860.302083333336 | 24.98 |
| 44860.3125 | 28.63 |
| 44860.322916666664 | 24.8 |
| 44860.333333333336 | 24.86 |
| 44860.34375 | 25.25 |
| 44860.354166666664 | 25.24 |
| 44860.364583333336 | 25.78 |
| 44860.375 | 26.72 |
| 44860.385416666664 | 26.1 |
| 44860.395833333336 | 26.31 |
| 44860.40625 | 26.15 |
| 44860.416666666664 | 25.47 |
| 44860.427083333336 | 25.19 |
| 44860.4375 | 25.62 |
| 44860.447916666664 | 25.36 |
| 44860.458333333336 | 25.12 |
| 44860.46875 | 25.47 |
| 44860.479166666664 | 27 |
| 44860.489583333336 | 26.57 |
| 44860.5 | 26.92 |
| 44860.510416666664 | 27.69 |
| 44860.520833333336 | 24.2 |
| 44860.53125 | 24.54 |
| 44860.541666666664 | 24.35 |
| 44860.552083333336 | 24.43 |
| 44860.5625 | 24.41 |
| 44860.572916666664 | 24.5 |
| 44860.583333333336 | 25.44 |
| 44860.59375 | 25.39 |
| 44860.604166666664 | 25.14 |
| 44860.614583333336 | 23.22 |
| 44860.625 | 24.84 |
| 44860.635416666664 | 24.35 |
| 44860.645833333336 | 24.84 |
| 44860.65625 | 25.51 |
| 44860.666666666664 | 25.84 |
| 44860.677083333336 | 23.35 |
| 44860.6875 | 24.32 |
| 44860.697916666664 | 25.6 |
| 44860.708333333336 | 25.5 |
| 44860.71875 | 26.75 |
| 44860.729166666664 | 26.02 |
| 44860.739583333336 | 25.76 |
| 44860.75 | 26.81 |
| 44860.760416666664 | 26.64 |
| 44860.770833333336 | 26.94 |
| 44860.78125 | 26.24 |
| 44860.791666666664 | 26.7 |
| 44860.802083333336 | 26.85 |
| 44860.8125 | 26.92 |
| 44860.822916666664 | 26.54 |
| 44860.833333333336 | 26.48 |
| 44860.84375 | 26.44 |
| 44860.854166666664 | 23.76 |
| 44860.864583333336 | 23.65 |
| 44860.875 | 23.42 |
| 44860.885416666664 | 24.13 |
| 44860.895833333336 | 24.42 |
| 44860.90625 | 23.96 |
| 44860.916666666664 | 23.07 |
| 44860.927083333336 | 22.07 |
| 44860.9375 | 22.44 |
| 44860.947916666664 | 21.53 |
| 44860.958333333336 | 21.33 |
| 44860.96875 | 20.89 |
| 44860.979166666664 | 21.84 |
| 44860.989583333336 | 22.02 |
| 44861.0 | 21.98 |
| 44861.010416666664 | 21.49 |
| 44861.020833333336 | 20.89 |
| 44861.03125 | 21.08 |
| 44861.041666666664 | 21.17 |
| 44861.052083333336 | 20.38 |
| 44861.0625 | 19.85 |
| 44861.072916666664 | 20.11 |
| 44861.083333333336 | 19.9 |
| 44861.09375 | 19.26 |
| 44861.104166666664 | 19.2 |
| 44861.114583333336 | 19.46 |
| 44861.125 | 19.11 |
| 44861.135416666664 | 18.81 |
| 44861.145833333336 | 19.05 |
| 44861.15625 | 17.95 |
| 44861.166666666664 | 12.03 |
| 44861.177083333336 | 11.86 |
| 44861.1875 | 11.88 |
| 44861.197916666664 | 11.69 |
| 44861.208333333336 | 12.08 |
| 44861.21875 | 12.09 |
| 44861.229166666664 | 12.56 |
| 44861.239583333336 | 12.21 |
| 44861.25 | 12.03 |
| 44861.260416666664 | 12.04 |
| 44861.270833333336 | 11.35 |
| 44861.28125 | 11.14 |
| 44861.291666666664 | 11.29 |
| 44861.302083333336 | 11.44 |
| 44861.3125 | 11.15 |
| 44861.322916666664 | 11.3 |
| 44861.333333333336 | 11.5 |
| 44861.34375 | 11.92 |
| 44861.354166666664 | 11.78 |
| 44861.364583333336 | 11.75 |
| 44861.375 | 11.78 |
| 44861.385416666664 | 12.11 |
| 44861.395833333336 | 12.12 |
| 44861.40625 | 12.62 |
| 44861.416666666664 | 12.78 |
| 44861.427083333336 | 12.6 |
| 44861.4375 | 12.69 |
| 44861.447916666664 | 12.66 |
| 44861.458333333336 | 12.51 |
| 44861.46875 | 12.27 |
| 44861.479166666664 | 12.34 |
| 44861.489583333336 | 12.81 |
| 44861.5 | 12.71 |
| 44861.510416666664 | 12.66 |
| 44861.520833333336 | 13.22 |
| 44861.53125 | 13.3 |
| 44861.541666666664 | 13.85 |
| 44861.552083333336 | 14.12 |
| 44861.5625 | 14.38 |
| 44861.572916666664 | 14.55 |
| 44861.583333333336 | 14.51 |
| 44861.59375 | 14.16 |
| 44861.604166666664 | 13.75 |
| 44861.614583333336 | 13.23 |
| 44861.625 | 18.66 |
| 44861.635416666664 | 12 |
| 44861.645833333336 | 12.17 |
| 44861.65625 | 12.32 |
| 44861.666666666664 | 12.77 |
| 44861.677083333336 | 12.98 |
| 44861.6875 | 11.98 |
| 44861.697916666664 | 11.83 |
| 44861.708333333336 | 11.57 |
| 44861.71875 | 12.42 |
| 44861.729166666664 | 12.99 |
| 44861.739583333336 | 12.31 |
| 44861.75 | 13.05 |
| 44861.760416666664 | 13.24 |
| 44861.770833333336 | 12.61 |
| 44861.78125 | 13.08 |
| 44861.791666666664 | 13.32 |
| 44861.802083333336 | 13.78 |
| 44861.8125 | 13.68 |
| 44861.822916666664 | 13.93 |
| 44861.833333333336 | 13.69 |
| 44861.84375 | 13.64 |
| 44861.854166666664 | 13.44 |
| 44861.864583333336 | 13.76 |
| 44861.875 | 13.87 |
| 44861.885416666664 | 14.29 |
| 44861.895833333336 | 13.31 |
| 44861.90625 | 13.44 |
| 44861.916666666664 | 14.01 |
| 44861.927083333336 | 14.58 |
| 44861.9375 | 14.28 |
| 44861.947916666664 | 13.71 |
| 44861.958333333336 | 13.64 |
| 44861.96875 | 13.7 |
| 44861.979166666664 | 13.89 |
| 44861.989583333336 | 13.91 |
| 44862.0 | 14.26 |
| 44862.010416666664 | 14.78 |
| 44862.020833333336 | 14.45 |
| 44862.03125 | 14.63 |
| 44862.041666666664 | 14.73 |
| 44862.052083333336 | 14.62 |
| 44862.0625 | 15.14 |
| 44862.072916666664 | 14.04 |
| 44862.083333333336 | 13.9 |
| 44862.09375 | 14.33 |
| 44862.104166666664 | 14.38 |
| 44862.114583333336 | 14.38 |
| 44862.125 | 13.99 |
| 44862.135416666664 | 13.93 |
| 44862.145833333336 | 14.02 |
| 44862.15625 | 14.56 |
| 44862.166666666664 | 14.17 |
| 44862.177083333336 | 14.15 |
| 44862.1875 | 14.07 |
| 44862.197916666664 | 13.93 |
| 44862.208333333336 | 14.26 |
| 44862.21875 | 14.48 |
| 44862.229166666664 | 13.99 |
| 44862.239583333336 | 14.15 |
| 44862.25 | 14.23 |
| 44862.260416666664 | 14.19 |
| 44862.270833333336 | 14.13 |
| 44862.28125 | 14.25 |
| 44862.291666666664 | 14.06 |
| 44862.302083333336 | 14.21 |
| 44862.3125 | 14.22 |
| 44862.322916666664 | 14.15 |
| 44862.333333333336 | 13.97 |
| 44862.34375 | 13.69 |
| 44862.354166666664 | 14.08 |
| 44862.364583333336 | 14.44 |
| 44862.375 | 14.27 |
| 44862.385416666664 | 14.35 |
| 44862.395833333336 | 14.45 |
| 44862.40625 | 15.04 |
| 44862.416666666664 | 14.98 |
| 44862.427083333336 | 15.17 |
| 44862.4375 | 15.38 |
| 44862.447916666664 | 15.42 |
| 44862.458333333336 | 14.94 |
| 44862.46875 | 15.48 |
| 44862.479166666664 | 15.51 |
| 44862.489583333336 | 15.52 |
| 44862.5 | 15.52 |
| 44862.510416666664 | 15.46 |
| 44862.520833333336 | 15.51 |
| 44862.53125 | 15.91 |
| 44862.541666666664 | 15.67 |
| 44862.552083333336 | 16 |
| 44862.5625 | 15.1 |
| 44862.572916666664 | 14.73 |
| 44862.583333333336 | 13.77 |
| 44862.59375 | 13.86 |
| 44862.604166666664 | 13.11 |
| 44862.614583333336 | 13.71 |
| 44862.625 | 13.47 |
| 44862.635416666664 | 14.48 |
| 44862.645833333336 | 14.11 |
| 44862.65625 | 13.88 |
| 44862.666666666664 | 13.16 |
| 44862.677083333336 | 12.94 |
| 44862.6875 | 11.79 |
| 44862.697916666664 | 11.6 |
| 44862.708333333336 | 11.71 |
| 44862.71875 | 10.29 |
| 44862.729166666664 | 11.75 |
| 44862.739583333336 | 11.94 |
| 44862.75 | 11.89 |
| 44862.760416666664 | 11.91 |
| 44862.770833333336 | 12.38 |
| 44862.78125 | 12.4 |
| 44862.791666666664 | 12.96 |
| 44862.802083333336 | 12.76 |
| 44862.8125 | 13.14 |
| 44862.822916666664 | 13.07 |
| 44862.833333333336 | 13.36 |
| 44862.84375 | 13.54 |
| 44862.854166666664 | 13.44 |
| 44862.864583333336 | 13.24 |
| 44862.875 | 12.93 |
| 44862.885416666664 | 13.4 |
| 44862.895833333336 | 12.98 |
| 44862.90625 | 13.33 |
| 44862.916666666664 | 13.1 |
| 44862.927083333336 | 13.57 |
| 44862.9375 | 13.37 |
| 44862.947916666664 | 13.01 |
| 44862.958333333336 | 12.99 |
| 44862.96875 | 12.62 |
| 44862.979166666664 | 12.77 |
| 44862.989583333336 | 13.71 |
| 44863.0 | 14.15 |
| 44863.010416666664 | 13.36 |
| 44863.020833333336 | 13.73 |
| 44863.03125 | 13.69 |
| 44863.041666666664 | 14 |
| 44863.052083333336 | 13.56 |
| 44863.0625 | 13.71 |
| 44863.072916666664 | 13.75 |
| 44863.083333333336 | 13.79 |
| 44863.09375 | 14.01 |
| 44863.104166666664 | 14.03 |
| 44863.114583333336 | 13.92 |
| 44863.125 | 14.18 |
| 44863.135416666664 | 14.44 |
| 44863.145833333336 | 14.08 |
| 44863.15625 | 14.33 |
| 44863.166666666664 | 13.69 |
| 44863.177083333336 | 13.67 |
| 44863.1875 | 13.84 |
| 44863.197916666664 | 14.01 |
| 44863.208333333336 | 13.9 |
| 44863.21875 | 13.89 |
| 44863.229166666664 | 13.31 |
| 44863.239583333336 | 12.98 |
| 44863.25 | 13.15 |
| 44863.260416666664 | 13.36 |
| 44863.270833333336 | 13.07 |
| 44863.28125 | 12.96 |
| 44863.291666666664 | 12.84 |
| 44863.302083333336 | 13.03 |
| 44863.3125 | 13.45 |
| 44863.322916666664 | 13.36 |
| 44863.333333333336 | 13 |
| 44863.34375 | 13.16 |
| 44863.354166666664 | 12.83 |
| 44863.364583333336 | 12.99 |
| 44863.375 | 13.25 |
| 44863.385416666664 | 13.2 |
| 44863.395833333336 | 13.07 |
| 44863.40625 | 13.21 |
| 44863.416666666664 | 13.13 |
| 44863.427083333336 | 13.22 |
| 44863.4375 | 13.23 |
| 44863.447916666664 | 13.09 |
| 44863.458333333336 | 12.81 |
| 44863.46875 | 12.99 |
| 44863.479166666664 | 13.33 |
| 44863.489583333336 | 13.27 |
| 44863.5 | 13.69 |
| 44863.510416666664 | 14.32 |
| 44863.520833333336 | 14.21 |
| 44863.53125 | 13.67 |
| 44863.541666666664 | 13.78 |
| 44863.552083333336 | 14.5 |
| 44863.5625 | 14.21 |
| 44863.572916666664 | 14.21 |
| 44863.583333333336 | 14.32 |
| 44863.59375 | 14.75 |
| 44863.604166666664 | 14.69 |
| 44863.614583333336 | 14.84 |
| 44863.625 | 14.83 |
| 44863.635416666664 | 14.75 |
| 44863.645833333336 | 14.55 |
| 44863.65625 | 14.09 |
| 44863.666666666664 | 14.21 |
| 44863.677083333336 | 14.66 |
| 44863.6875 | 15.31 |
| 44863.697916666664 | 14.82 |
| 44863.708333333336 | 15.08 |
| 44863.71875 | 15.49 |
| 44863.729166666664 | 15.55 |
| 44863.739583333336 | 25.89 |
| 44863.75 | 7.44 |
| 44863.760416666664 | 7.45 |
| 44863.770833333336 | 7.61 |
| 44863.78125 | 8.02 |
| 44863.791666666664 | 7.19 |
| 44863.802083333336 | 7.7 |
| 44863.8125 | 7.57 |
| 44863.822916666664 | 8.03 |
| 44863.833333333336 | 7.9 |
| 44863.84375 | 20.63 |
| 44863.854166666664 | 7.9 |
| 44863.864583333336 | 7.85 |
| 44863.875 | 7.83 |
| 44863.885416666664 | 8 |
| 44863.895833333336 | 8.4 |
| 44863.90625 | 8.07 |
| 44863.916666666664 | 8.29 |
| 44863.927083333336 | 8.76 |
| 44863.9375 | 8.63 |
| 44863.947916666664 | 9.12 |
| 44863.958333333336 | 8.85 |
| 44863.96875 | 8.95 |
| 44863.979166666664 | 9.11 |
| 44863.989583333336 | 8.65 |
| 44864.0 | 8.77 |
| 44864.010416666664 | 8.75 |
| 44864.020833333336 | 9.13 |
| 44864.03125 | 8.78 |
| 44864.041666666664 | 8.6 |
| 44864.052083333336 | 8.58 |
| 44864.0625 | 8.06 |
| 44864.072916666664 | 7.91 |
| 44864.083333333336 | 8.05 |
| 44864.09375 | 8.18 |
| 44864.104166666664 | 7.9 |
| 44864.114583333336 | 7.9 |
| 44864.125 | 8.04 |
| 44864.135416666664 | 8.14 |
| 44864.145833333336 | 8.26 |
| 44864.15625 | 8.01 |
| 44864.166666666664 | 110.99 |
| 44864.177083333336 | 7.48 |
| 44864.1875 | 19.6 |
| 44864.197916666664 | 7.78 |
| 44864.208333333336 | 7.53 |
| 44864.21875 | 12.36 |
| 44864.229166666664 | 17.34 |
| 44864.239583333336 | 8.04 |
| 44864.25 | 8.52 |
| 44864.260416666664 | 7.26 |
| 44864.270833333336 | 59.35 |
| 44864.28125 | 8.82 |
| 44864.291666666664 | 7.77 |
| 44864.302083333336 | 7.31 |
| 44864.3125 | 7.02 |
| 44864.322916666664 | 7.12 |
| 44864.333333333336 | 7.26 |
| 44864.34375 | 7.31 |
| 44864.354166666664 | 7.32 |
| 44864.364583333336 | 7.25 |
| 44864.375 | 7.34 |
| 44864.385416666664 | 7.38 |
| 44864.395833333336 | 7.33 |
| 44864.40625 | 7.29 |
| 44864.416666666664 | 7.3 |
| 44864.427083333336 | 7.32 |
| 44864.4375 | 7.56 |
| 44864.447916666664 | 7.58 |
| 44864.458333333336 | 7.49 |
| 44864.46875 | 7.55 |
| 44864.479166666664 | 7.73 |
| 44864.489583333336 | 7.47 |
| 44864.5 | 7.48 |
| 44864.510416666664 | 7.57 |
| 44864.520833333336 | 7.61 |
| 44864.53125 | 7.76 |
| 44864.541666666664 | 7.85 |
| 44864.552083333336 | 7.82 |
| 44864.5625 | 7.89 |
| 44864.572916666664 | 7.73 |
| 44864.583333333336 | 7.74 |
| 44864.59375 | 8.18 |
| 44864.604166666664 | 8.47 |
| 44864.614583333336 | 8.67 |
| 44864.625 | 8.29 |
| 44864.635416666664 | 8.53 |
| 44864.645833333336 | 8.47 |
| 44864.65625 | 7.62 |
| 44864.666666666664 | 7.81 |
| 44864.677083333336 | 7.88 |
| 44864.6875 | 8.21 |
| 44864.697916666664 | 8.35 |
| 44864.708333333336 | 8.51 |
| 44864.71875 | 8.53 |
| 44864.729166666664 | 8.36 |
| 44864.739583333336 | 8.37 |
| 44864.75 | 8.22 |
| 44864.760416666664 | 8.73 |
| 44864.770833333336 | 9.22 |
| 44864.78125 | 8.3 |
| 44864.791666666664 | 8.43 |
| 44864.802083333336 | 8.7 |
| 44864.8125 | 8.44 |
| 44864.822916666664 | 9.04 |
| 44864.833333333336 | 9.13 |
| 44864.84375 | 9.12 |
| 44864.854166666664 | 9.03 |
| 44864.864583333336 | 9.36 |
| 44864.875 | 9.27 |
| 44864.885416666664 | 9.25 |
| 44864.895833333336 | 9.49 |
| 44864.90625 | 9.56 |
| 44864.916666666664 | 9.96 |
| 44864.927083333336 | 9.82 |
| 44864.9375 | 10.04 |
| 44864.947916666664 | 10.04 |
| 44864.958333333336 | 11.78 |
| 44864.96875 | 11.05 |
| 44864.979166666664 | 9.99 |
| 44864.989583333336 | 10.34 |
| 44865.0 | 10.15 |
| 44865.010416666664 | 10.28 |
| 44865.020833333336 | 10.25 |
| 44865.03125 | 230.72 |
| 44865.041666666664 | 9.51 |
| 44865.052083333336 | 9.42 |
| 44865.0625 | 9.63 |
| 44865.072916666664 | 9.55 |
| 44865.083333333336 | 9.48 |
| 44865.09375 | 9.53 |
| 44865.104166666664 | 9.43 |
| 44865.114583333336 | 9.44 |
| 44865.125 | 9.32 |
| 44865.135416666664 | 9.49 |
| 44865.145833333336 | 9.41 |
| 44865.15625 | 9.73 |
| 44865.166666666664 | 9.73 |
| 44865.177083333336 | 9.86 |
| 44865.1875 | 9.78 |
| 44865.197916666664 | 9.71 |
| 44865.208333333336 | 9.87 |
| 44865.21875 | 9.94 |
| 44865.229166666664 | 10.19 |
| 44865.239583333336 | 9.49 |
| 44865.25 | 9.29 |
| 44865.260416666664 | 9.92 |
| 44865.270833333336 | 9.56 |
| 44865.28125 | 9.26 |
| 44865.291666666664 | 9.22 |
| 44865.302083333336 | 9.24 |
| 44865.3125 | 9.02 |
| 44865.322916666664 | 8.92 |
| 44865.333333333336 | 8.81 |
| 44865.34375 | 8.66 |
| 44865.354166666664 | 8.85 |
| 44865.364583333336 | 8.92 |
| 44865.375 | 9.08 |
| 44865.385416666664 | 8.96 |
| 44865.395833333336 | 9.05 |
| 44865.40625 | 9.44 |
| 44865.416666666664 | 9.27 |
| 44865.427083333336 | 9.27 |
| 44865.4375 | 9.08 |
| 44865.447916666664 | 9.2 |
| 44865.458333333336 | 9.28 |
| 44865.46875 | 9.23 |
| 44865.479166666664 | 9.51 |
| 44865.489583333336 | 9.74 |
| 44865.5 | 10.02 |
| 44865.510416666664 | 9.75 |
| 44865.520833333336 | 10.14 |
| 44865.53125 | 9.86 |
| 44865.541666666664 | 10.01 |
| 44865.552083333336 | 9.99 |
| 44865.5625 | 10.21 |
| 44865.572916666664 | 10 |
| 44865.583333333336 | 10.06 |
| 44865.59375 | 10.11 |
| 44865.604166666664 | 10.41 |
| 44865.614583333336 | 10.55 |
| 44865.625 | 10.86 |
| 44865.635416666664 | 10.76 |
| 44865.645833333336 | 10.98 |
| 44865.65625 | 10.93 |
| 44865.666666666664 | 11.37 |
| 44865.677083333336 | 11.1 |
| 44865.6875 | 11.31 |
| 44865.697916666664 | 11.52 |
| 44865.708333333336 | 11.28 |
| 44865.71875 | 11.43 |
| 44865.729166666664 | 12.03 |
| 44865.739583333336 | 11.2 |
| 44865.75 | 11.65 |
| 44865.760416666664 | 11.73 |
| 44865.770833333336 | 11.62 |
| 44865.78125 | 11.72 |
| 44865.791666666664 | 11.85 |
| 44865.802083333336 | 11.57 |
| 44865.8125 | 12.1 |
| 44865.822916666664 | 11.32 |
| 44865.833333333336 | 10.98 |
| 44865.84375 | 11.09 |
| 44865.854166666664 | 11.45 |
| 44865.864583333336 | 11.69 |
| 44865.875 | 11.49 |
| 44865.885416666664 | 11.72 |
| 44865.895833333336 | 11.78 |
| 44865.90625 | 11.96 |
| 44865.916666666664 | 12.61 |
| 44865.927083333336 | 12.66 |
| 44865.9375 | 12.67 |
| 44865.947916666664 | 12.7 |
| 44865.958333333336 | 12.75 |
| 44865.96875 | 12.75 |
| 44865.979166666664 | 12.72 |
| 44865.989583333336 | 12.75 |
| 44866.0 | 12.47 |
| 44866.010416666664 | 12.64 |
| 44866.020833333336 | 12.64 |
| 44866.03125 | 13.26 |
| 44866.041666666664 | 13.08 |
| 44866.052083333336 | 13.02 |
| 44866.0625 | 13.13 |
| 44866.072916666664 | 13.37 |
| 44866.083333333336 | 13 |
| 44866.09375 | 12.88 |
| 44866.104166666664 | 13.14 |
| 44866.114583333336 | 13.07 |
| 44866.125 | 12.68 |
| 44866.135416666664 | 12.4 |
| 44866.145833333336 | 12.49 |